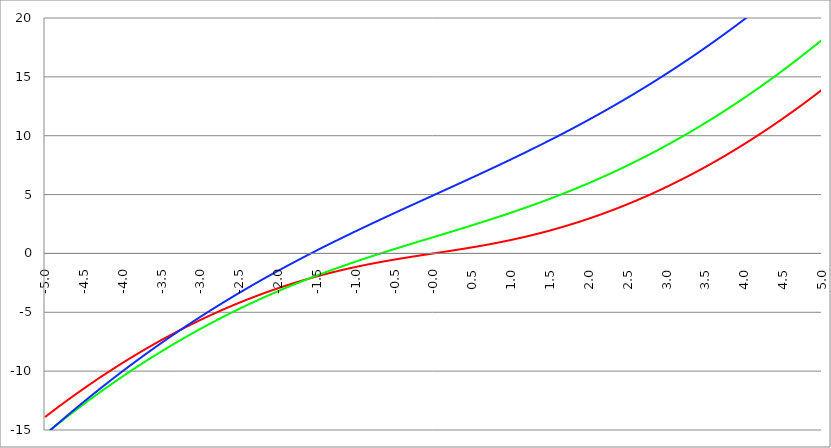
| Category | Series 1 | Series 0 | Series 2 |
|---|---|---|---|
| -5.0 | -13.904 | -15.371 | -15.411 |
| -4.995 | -13.878 | -15.344 | -15.382 |
| -4.99 | -13.853 | -15.317 | -15.352 |
| -4.985 | -13.827 | -15.29 | -15.323 |
| -4.98 | -13.802 | -15.264 | -15.294 |
| -4.975 | -13.777 | -15.237 | -15.265 |
| -4.97 | -13.751 | -15.21 | -15.236 |
| -4.965000000000001 | -13.726 | -15.183 | -15.207 |
| -4.960000000000001 | -13.701 | -15.156 | -15.178 |
| -4.955000000000001 | -13.675 | -15.13 | -15.149 |
| -4.950000000000001 | -13.65 | -15.103 | -15.12 |
| -4.945000000000001 | -13.625 | -15.076 | -15.091 |
| -4.940000000000001 | -13.6 | -15.05 | -15.062 |
| -4.935000000000001 | -13.574 | -15.023 | -15.034 |
| -4.930000000000001 | -13.549 | -14.996 | -15.005 |
| -4.925000000000002 | -13.524 | -14.97 | -14.976 |
| -4.920000000000002 | -13.499 | -14.943 | -14.947 |
| -4.915000000000002 | -13.474 | -14.917 | -14.918 |
| -4.910000000000002 | -13.449 | -14.89 | -14.889 |
| -4.905000000000002 | -13.424 | -14.864 | -14.861 |
| -4.900000000000002 | -13.399 | -14.837 | -14.832 |
| -4.895000000000002 | -13.374 | -14.811 | -14.803 |
| -4.890000000000002 | -13.349 | -14.784 | -14.774 |
| -4.885000000000002 | -13.324 | -14.758 | -14.746 |
| -4.880000000000002 | -13.299 | -14.732 | -14.717 |
| -4.875000000000003 | -13.274 | -14.705 | -14.689 |
| -4.870000000000003 | -13.249 | -14.679 | -14.66 |
| -4.865000000000003 | -13.224 | -14.653 | -14.631 |
| -4.860000000000003 | -13.2 | -14.626 | -14.603 |
| -4.855000000000003 | -13.175 | -14.6 | -14.574 |
| -4.850000000000003 | -13.15 | -14.574 | -14.546 |
| -4.845000000000003 | -13.125 | -14.548 | -14.517 |
| -4.840000000000003 | -13.1 | -14.521 | -14.489 |
| -4.835000000000003 | -13.076 | -14.495 | -14.46 |
| -4.830000000000004 | -13.051 | -14.469 | -14.432 |
| -4.825000000000004 | -13.026 | -14.443 | -14.403 |
| -4.820000000000004 | -13.002 | -14.417 | -14.375 |
| -4.815000000000004 | -12.977 | -14.391 | -14.347 |
| -4.810000000000004 | -12.953 | -14.365 | -14.318 |
| -4.805000000000004 | -12.928 | -14.339 | -14.29 |
| -4.800000000000004 | -12.904 | -14.313 | -14.262 |
| -4.795000000000004 | -12.879 | -14.287 | -14.233 |
| -4.790000000000004 | -12.855 | -14.261 | -14.205 |
| -4.785000000000004 | -12.83 | -14.235 | -14.177 |
| -4.780000000000004 | -12.806 | -14.209 | -14.149 |
| -4.775000000000004 | -12.781 | -14.183 | -14.12 |
| -4.770000000000004 | -12.757 | -14.157 | -14.092 |
| -4.765000000000005 | -12.733 | -14.131 | -14.064 |
| -4.760000000000005 | -12.708 | -14.105 | -14.036 |
| -4.755000000000005 | -12.684 | -14.08 | -14.008 |
| -4.750000000000005 | -12.66 | -14.054 | -13.98 |
| -4.745000000000005 | -12.635 | -14.028 | -13.952 |
| -4.740000000000005 | -12.611 | -14.002 | -13.924 |
| -4.735000000000005 | -12.587 | -13.977 | -13.895 |
| -4.730000000000005 | -12.563 | -13.951 | -13.867 |
| -4.725000000000006 | -12.539 | -13.925 | -13.839 |
| -4.720000000000006 | -12.514 | -13.9 | -13.811 |
| -4.715000000000006 | -12.49 | -13.874 | -13.784 |
| -4.710000000000006 | -12.466 | -13.848 | -13.756 |
| -4.705000000000006 | -12.442 | -13.823 | -13.728 |
| -4.700000000000006 | -12.418 | -13.797 | -13.7 |
| -4.695000000000006 | -12.394 | -13.772 | -13.672 |
| -4.690000000000006 | -12.37 | -13.746 | -13.644 |
| -4.685000000000007 | -12.346 | -13.721 | -13.616 |
| -4.680000000000007 | -12.322 | -13.695 | -13.588 |
| -4.675000000000007 | -12.298 | -13.67 | -13.561 |
| -4.670000000000007 | -12.274 | -13.644 | -13.533 |
| -4.665000000000007 | -12.251 | -13.619 | -13.505 |
| -4.660000000000007 | -12.227 | -13.594 | -13.477 |
| -4.655000000000007 | -12.203 | -13.568 | -13.45 |
| -4.650000000000007 | -12.179 | -13.543 | -13.422 |
| -4.645000000000007 | -12.155 | -13.518 | -13.394 |
| -4.640000000000008 | -12.132 | -13.492 | -13.367 |
| -4.635000000000008 | -12.108 | -13.467 | -13.339 |
| -4.630000000000008 | -12.084 | -13.442 | -13.312 |
| -4.625000000000008 | -12.061 | -13.417 | -13.284 |
| -4.620000000000008 | -12.037 | -13.392 | -13.256 |
| -4.615000000000008 | -12.013 | -13.366 | -13.229 |
| -4.610000000000008 | -11.99 | -13.341 | -13.201 |
| -4.605000000000008 | -11.966 | -13.316 | -13.174 |
| -4.600000000000008 | -11.943 | -13.291 | -13.146 |
| -4.595000000000009 | -11.919 | -13.266 | -13.119 |
| -4.590000000000009 | -11.895 | -13.241 | -13.092 |
| -4.585000000000009 | -11.872 | -13.216 | -13.064 |
| -4.580000000000009 | -11.849 | -13.191 | -13.037 |
| -4.57500000000001 | -11.825 | -13.166 | -13.009 |
| -4.57000000000001 | -11.802 | -13.141 | -12.982 |
| -4.565000000000009 | -11.778 | -13.116 | -12.955 |
| -4.560000000000009 | -11.755 | -13.091 | -12.927 |
| -4.555000000000009 | -11.732 | -13.066 | -12.9 |
| -4.55000000000001 | -11.708 | -13.041 | -12.873 |
| -4.54500000000001 | -11.685 | -13.017 | -12.846 |
| -4.54000000000001 | -11.662 | -12.992 | -12.818 |
| -4.53500000000001 | -11.639 | -12.967 | -12.791 |
| -4.53000000000001 | -11.615 | -12.942 | -12.764 |
| -4.52500000000001 | -11.592 | -12.917 | -12.737 |
| -4.52000000000001 | -11.569 | -12.893 | -12.71 |
| -4.51500000000001 | -11.546 | -12.868 | -12.683 |
| -4.51000000000001 | -11.523 | -12.843 | -12.656 |
| -4.505000000000011 | -11.5 | -12.819 | -12.628 |
| -4.500000000000011 | -11.477 | -12.794 | -12.601 |
| -4.495000000000011 | -11.454 | -12.769 | -12.574 |
| -4.490000000000011 | -11.431 | -12.745 | -12.547 |
| -4.485000000000011 | -11.408 | -12.72 | -12.52 |
| -4.480000000000011 | -11.385 | -12.696 | -12.493 |
| -4.475000000000011 | -11.362 | -12.671 | -12.466 |
| -4.470000000000011 | -11.339 | -12.647 | -12.44 |
| -4.465000000000011 | -11.316 | -12.622 | -12.413 |
| -4.460000000000011 | -11.293 | -12.598 | -12.386 |
| -4.455000000000012 | -11.27 | -12.573 | -12.359 |
| -4.450000000000012 | -11.247 | -12.549 | -12.332 |
| -4.445000000000012 | -11.225 | -12.525 | -12.305 |
| -4.440000000000012 | -11.202 | -12.5 | -12.278 |
| -4.435000000000012 | -11.179 | -12.476 | -12.252 |
| -4.430000000000012 | -11.156 | -12.452 | -12.225 |
| -4.425000000000012 | -11.134 | -12.427 | -12.198 |
| -4.420000000000012 | -11.111 | -12.403 | -12.171 |
| -4.415000000000012 | -11.088 | -12.379 | -12.145 |
| -4.410000000000013 | -11.066 | -12.354 | -12.118 |
| -4.405000000000013 | -11.043 | -12.33 | -12.091 |
| -4.400000000000013 | -11.021 | -12.306 | -12.065 |
| -4.395000000000013 | -10.998 | -12.282 | -12.038 |
| -4.390000000000013 | -10.975 | -12.258 | -12.012 |
| -4.385000000000013 | -10.953 | -12.234 | -11.985 |
| -4.380000000000013 | -10.931 | -12.21 | -11.958 |
| -4.375000000000013 | -10.908 | -12.186 | -11.932 |
| -4.370000000000013 | -10.886 | -12.162 | -11.905 |
| -4.365000000000013 | -10.863 | -12.138 | -11.879 |
| -4.360000000000014 | -10.841 | -12.114 | -11.852 |
| -4.355000000000014 | -10.819 | -12.09 | -11.826 |
| -4.350000000000014 | -10.796 | -12.066 | -11.799 |
| -4.345000000000014 | -10.774 | -12.042 | -11.773 |
| -4.340000000000014 | -10.752 | -12.018 | -11.747 |
| -4.335000000000014 | -10.729 | -11.994 | -11.72 |
| -4.330000000000014 | -10.707 | -11.97 | -11.694 |
| -4.325000000000014 | -10.685 | -11.946 | -11.668 |
| -4.320000000000014 | -10.663 | -11.922 | -11.641 |
| -4.315000000000015 | -10.641 | -11.899 | -11.615 |
| -4.310000000000015 | -10.618 | -11.875 | -11.589 |
| -4.305000000000015 | -10.596 | -11.851 | -11.563 |
| -4.300000000000015 | -10.574 | -11.827 | -11.536 |
| -4.295000000000015 | -10.552 | -11.804 | -11.51 |
| -4.290000000000015 | -10.53 | -11.78 | -11.484 |
| -4.285000000000015 | -10.508 | -11.756 | -11.458 |
| -4.280000000000015 | -10.486 | -11.733 | -11.432 |
| -4.275000000000015 | -10.464 | -11.709 | -11.405 |
| -4.270000000000015 | -10.442 | -11.685 | -11.379 |
| -4.265000000000016 | -10.42 | -11.662 | -11.353 |
| -4.260000000000016 | -10.398 | -11.638 | -11.327 |
| -4.255000000000016 | -10.377 | -11.615 | -11.301 |
| -4.250000000000016 | -10.355 | -11.591 | -11.275 |
| -4.245000000000016 | -10.333 | -11.568 | -11.249 |
| -4.240000000000016 | -10.311 | -11.544 | -11.223 |
| -4.235000000000016 | -10.289 | -11.521 | -11.197 |
| -4.230000000000016 | -10.268 | -11.498 | -11.171 |
| -4.225000000000017 | -10.246 | -11.474 | -11.145 |
| -4.220000000000017 | -10.224 | -11.451 | -11.119 |
| -4.215000000000017 | -10.202 | -11.428 | -11.094 |
| -4.210000000000017 | -10.181 | -11.404 | -11.068 |
| -4.205000000000017 | -10.159 | -11.381 | -11.042 |
| -4.200000000000017 | -10.138 | -11.358 | -11.016 |
| -4.195000000000017 | -10.116 | -11.334 | -10.99 |
| -4.190000000000017 | -10.094 | -11.311 | -10.965 |
| -4.185000000000017 | -10.073 | -11.288 | -10.939 |
| -4.180000000000017 | -10.051 | -11.265 | -10.913 |
| -4.175000000000018 | -10.03 | -11.242 | -10.887 |
| -4.170000000000018 | -10.009 | -11.218 | -10.862 |
| -4.165000000000018 | -9.987 | -11.195 | -10.836 |
| -4.160000000000018 | -9.966 | -11.172 | -10.81 |
| -4.155000000000018 | -9.944 | -11.149 | -10.785 |
| -4.150000000000018 | -9.923 | -11.126 | -10.759 |
| -4.145000000000018 | -9.902 | -11.103 | -10.733 |
| -4.140000000000018 | -9.88 | -11.08 | -10.708 |
| -4.135000000000018 | -9.859 | -11.057 | -10.682 |
| -4.130000000000019 | -9.838 | -11.034 | -10.657 |
| -4.125000000000019 | -9.817 | -11.011 | -10.631 |
| -4.120000000000019 | -9.795 | -10.988 | -10.606 |
| -4.115000000000019 | -9.774 | -10.965 | -10.58 |
| -4.110000000000019 | -9.753 | -10.943 | -10.555 |
| -4.105000000000019 | -9.732 | -10.92 | -10.529 |
| -4.100000000000019 | -9.711 | -10.897 | -10.504 |
| -4.095000000000019 | -9.69 | -10.874 | -10.479 |
| -4.090000000000019 | -9.669 | -10.851 | -10.453 |
| -4.085000000000019 | -9.648 | -10.829 | -10.428 |
| -4.08000000000002 | -9.627 | -10.806 | -10.403 |
| -4.07500000000002 | -9.606 | -10.783 | -10.377 |
| -4.07000000000002 | -9.585 | -10.76 | -10.352 |
| -4.06500000000002 | -9.564 | -10.738 | -10.327 |
| -4.06000000000002 | -9.543 | -10.715 | -10.301 |
| -4.05500000000002 | -9.522 | -10.693 | -10.276 |
| -4.05000000000002 | -9.501 | -10.67 | -10.251 |
| -4.04500000000002 | -9.48 | -10.647 | -10.226 |
| -4.04000000000002 | -9.459 | -10.625 | -10.201 |
| -4.03500000000002 | -9.438 | -10.602 | -10.175 |
| -4.03000000000002 | -9.418 | -10.58 | -10.15 |
| -4.025000000000021 | -9.397 | -10.557 | -10.125 |
| -4.020000000000021 | -9.376 | -10.535 | -10.1 |
| -4.015000000000021 | -9.356 | -10.512 | -10.075 |
| -4.010000000000021 | -9.335 | -10.49 | -10.05 |
| -4.005000000000021 | -9.314 | -10.468 | -10.025 |
| -4.000000000000021 | -9.294 | -10.445 | -10 |
| -3.995000000000021 | -9.273 | -10.423 | -9.975 |
| -3.990000000000021 | -9.252 | -10.401 | -9.95 |
| -3.985000000000022 | -9.232 | -10.378 | -9.925 |
| -3.980000000000022 | -9.211 | -10.356 | -9.9 |
| -3.975000000000022 | -9.191 | -10.334 | -9.875 |
| -3.970000000000022 | -9.17 | -10.311 | -9.85 |
| -3.965000000000022 | -9.15 | -10.289 | -9.825 |
| -3.960000000000022 | -9.129 | -10.267 | -9.801 |
| -3.955000000000022 | -9.109 | -10.245 | -9.776 |
| -3.950000000000022 | -9.089 | -10.223 | -9.751 |
| -3.945000000000022 | -9.068 | -10.201 | -9.726 |
| -3.940000000000023 | -9.048 | -10.179 | -9.701 |
| -3.935000000000023 | -9.028 | -10.156 | -9.677 |
| -3.930000000000023 | -9.007 | -10.134 | -9.652 |
| -3.925000000000023 | -8.987 | -10.112 | -9.627 |
| -3.920000000000023 | -8.967 | -10.09 | -9.603 |
| -3.915000000000023 | -8.947 | -10.068 | -9.578 |
| -3.910000000000023 | -8.926 | -10.046 | -9.553 |
| -3.905000000000023 | -8.906 | -10.024 | -9.529 |
| -3.900000000000023 | -8.886 | -10.002 | -9.504 |
| -3.895000000000023 | -8.866 | -9.981 | -9.479 |
| -3.890000000000024 | -8.846 | -9.959 | -9.455 |
| -3.885000000000024 | -8.826 | -9.937 | -9.43 |
| -3.880000000000024 | -8.806 | -9.915 | -9.406 |
| -3.875000000000024 | -8.786 | -9.893 | -9.381 |
| -3.870000000000024 | -8.766 | -9.871 | -9.357 |
| -3.865000000000024 | -8.746 | -9.85 | -9.332 |
| -3.860000000000024 | -8.726 | -9.828 | -9.308 |
| -3.855000000000024 | -8.706 | -9.806 | -9.283 |
| -3.850000000000024 | -8.686 | -9.784 | -9.259 |
| -3.845000000000025 | -8.666 | -9.763 | -9.235 |
| -3.840000000000025 | -8.646 | -9.741 | -9.21 |
| -3.835000000000025 | -8.626 | -9.719 | -9.186 |
| -3.830000000000025 | -8.607 | -9.698 | -9.161 |
| -3.825000000000025 | -8.587 | -9.676 | -9.137 |
| -3.820000000000025 | -8.567 | -9.655 | -9.113 |
| -3.815000000000025 | -8.547 | -9.633 | -9.089 |
| -3.810000000000025 | -8.528 | -9.612 | -9.064 |
| -3.805000000000025 | -8.508 | -9.59 | -9.04 |
| -3.800000000000026 | -8.488 | -9.569 | -9.016 |
| -3.795000000000026 | -8.469 | -9.547 | -8.992 |
| -3.790000000000026 | -8.449 | -9.526 | -8.968 |
| -3.785000000000026 | -8.429 | -9.504 | -8.943 |
| -3.780000000000026 | -8.41 | -9.483 | -8.919 |
| -3.775000000000026 | -8.39 | -9.462 | -8.895 |
| -3.770000000000026 | -8.371 | -9.44 | -8.871 |
| -3.765000000000026 | -8.351 | -9.419 | -8.847 |
| -3.760000000000026 | -8.332 | -9.398 | -8.823 |
| -3.755000000000026 | -8.312 | -9.376 | -8.799 |
| -3.750000000000027 | -8.293 | -9.355 | -8.775 |
| -3.745000000000027 | -8.274 | -9.334 | -8.751 |
| -3.740000000000027 | -8.254 | -9.313 | -8.727 |
| -3.735000000000027 | -8.235 | -9.291 | -8.703 |
| -3.730000000000027 | -8.216 | -9.27 | -8.679 |
| -3.725000000000027 | -8.196 | -9.249 | -8.655 |
| -3.720000000000027 | -8.177 | -9.228 | -8.631 |
| -3.715000000000027 | -8.158 | -9.207 | -8.607 |
| -3.710000000000027 | -8.139 | -9.186 | -8.583 |
| -3.705000000000028 | -8.119 | -9.165 | -8.559 |
| -3.700000000000028 | -8.1 | -9.144 | -8.536 |
| -3.695000000000028 | -8.081 | -9.123 | -8.512 |
| -3.690000000000028 | -8.062 | -9.102 | -8.488 |
| -3.685000000000028 | -8.043 | -9.081 | -8.464 |
| -3.680000000000028 | -8.024 | -9.06 | -8.441 |
| -3.675000000000028 | -8.005 | -9.039 | -8.417 |
| -3.670000000000028 | -7.986 | -9.018 | -8.393 |
| -3.665000000000028 | -7.967 | -8.997 | -8.369 |
| -3.660000000000028 | -7.948 | -8.976 | -8.346 |
| -3.655000000000029 | -7.929 | -8.955 | -8.322 |
| -3.650000000000029 | -7.91 | -8.934 | -8.298 |
| -3.645000000000029 | -7.891 | -8.914 | -8.275 |
| -3.640000000000029 | -7.872 | -8.893 | -8.251 |
| -3.635000000000029 | -7.853 | -8.872 | -8.228 |
| -3.630000000000029 | -7.834 | -8.851 | -8.204 |
| -3.625000000000029 | -7.815 | -8.831 | -8.181 |
| -3.620000000000029 | -7.797 | -8.81 | -8.157 |
| -3.615000000000029 | -7.778 | -8.789 | -8.134 |
| -3.61000000000003 | -7.759 | -8.769 | -8.11 |
| -3.60500000000003 | -7.74 | -8.748 | -8.087 |
| -3.60000000000003 | -7.722 | -8.727 | -8.063 |
| -3.59500000000003 | -7.703 | -8.707 | -8.04 |
| -3.59000000000003 | -7.684 | -8.686 | -8.016 |
| -3.58500000000003 | -7.666 | -8.666 | -7.993 |
| -3.58000000000003 | -7.647 | -8.645 | -7.97 |
| -3.57500000000003 | -7.629 | -8.625 | -7.946 |
| -3.57000000000003 | -7.61 | -8.604 | -7.923 |
| -3.565000000000031 | -7.592 | -8.584 | -7.9 |
| -3.560000000000031 | -7.573 | -8.563 | -7.876 |
| -3.555000000000031 | -7.555 | -8.543 | -7.853 |
| -3.550000000000031 | -7.536 | -8.523 | -7.83 |
| -3.545000000000031 | -7.518 | -8.502 | -7.807 |
| -3.540000000000031 | -7.499 | -8.482 | -7.783 |
| -3.535000000000031 | -7.481 | -8.462 | -7.76 |
| -3.530000000000031 | -7.463 | -8.441 | -7.737 |
| -3.525000000000031 | -7.444 | -8.421 | -7.714 |
| -3.520000000000032 | -7.426 | -8.401 | -7.691 |
| -3.515000000000032 | -7.408 | -8.381 | -7.668 |
| -3.510000000000032 | -7.389 | -8.36 | -7.645 |
| -3.505000000000032 | -7.371 | -8.34 | -7.621 |
| -3.500000000000032 | -7.353 | -8.32 | -7.598 |
| -3.495000000000032 | -7.335 | -8.3 | -7.575 |
| -3.490000000000032 | -7.317 | -8.28 | -7.552 |
| -3.485000000000032 | -7.298 | -8.26 | -7.529 |
| -3.480000000000032 | -7.28 | -8.24 | -7.506 |
| -3.475000000000032 | -7.262 | -8.219 | -7.483 |
| -3.470000000000033 | -7.244 | -8.199 | -7.46 |
| -3.465000000000033 | -7.226 | -8.179 | -7.438 |
| -3.460000000000033 | -7.208 | -8.159 | -7.415 |
| -3.455000000000033 | -7.19 | -8.139 | -7.392 |
| -3.450000000000033 | -7.172 | -8.12 | -7.369 |
| -3.445000000000033 | -7.154 | -8.1 | -7.346 |
| -3.440000000000033 | -7.136 | -8.08 | -7.323 |
| -3.435000000000033 | -7.118 | -8.06 | -7.3 |
| -3.430000000000033 | -7.101 | -8.04 | -7.278 |
| -3.425000000000034 | -7.083 | -8.02 | -7.255 |
| -3.420000000000034 | -7.065 | -8 | -7.232 |
| -3.415000000000034 | -7.047 | -7.98 | -7.209 |
| -3.410000000000034 | -7.029 | -7.961 | -7.187 |
| -3.405000000000034 | -7.011 | -7.941 | -7.164 |
| -3.400000000000034 | -6.994 | -7.921 | -7.141 |
| -3.395000000000034 | -6.976 | -7.901 | -7.119 |
| -3.390000000000034 | -6.958 | -7.882 | -7.096 |
| -3.385000000000034 | -6.941 | -7.862 | -7.073 |
| -3.380000000000034 | -6.923 | -7.842 | -7.051 |
| -3.375000000000035 | -6.905 | -7.823 | -7.028 |
| -3.370000000000035 | -6.888 | -7.803 | -7.006 |
| -3.365000000000035 | -6.87 | -7.784 | -6.983 |
| -3.360000000000035 | -6.853 | -7.764 | -6.96 |
| -3.355000000000035 | -6.835 | -7.745 | -6.938 |
| -3.350000000000035 | -6.818 | -7.725 | -6.915 |
| -3.345000000000035 | -6.8 | -7.706 | -6.893 |
| -3.340000000000035 | -6.783 | -7.686 | -6.87 |
| -3.335000000000035 | -6.765 | -7.667 | -6.848 |
| -3.330000000000036 | -6.748 | -7.647 | -6.826 |
| -3.325000000000036 | -6.731 | -7.628 | -6.803 |
| -3.320000000000036 | -6.713 | -7.608 | -6.781 |
| -3.315000000000036 | -6.696 | -7.589 | -6.758 |
| -3.310000000000036 | -6.679 | -7.57 | -6.736 |
| -3.305000000000036 | -6.661 | -7.55 | -6.714 |
| -3.300000000000036 | -6.644 | -7.531 | -6.692 |
| -3.295000000000036 | -6.627 | -7.512 | -6.669 |
| -3.290000000000036 | -6.61 | -7.492 | -6.647 |
| -3.285000000000036 | -6.593 | -7.473 | -6.625 |
| -3.280000000000036 | -6.575 | -7.454 | -6.602 |
| -3.275000000000037 | -6.558 | -7.435 | -6.58 |
| -3.270000000000037 | -6.541 | -7.416 | -6.558 |
| -3.265000000000037 | -6.524 | -7.396 | -6.536 |
| -3.260000000000037 | -6.507 | -7.377 | -6.514 |
| -3.255000000000037 | -6.49 | -7.358 | -6.492 |
| -3.250000000000037 | -6.473 | -7.339 | -6.469 |
| -3.245000000000037 | -6.456 | -7.32 | -6.447 |
| -3.240000000000037 | -6.439 | -7.301 | -6.425 |
| -3.235000000000038 | -6.422 | -7.282 | -6.403 |
| -3.230000000000038 | -6.405 | -7.263 | -6.381 |
| -3.225000000000038 | -6.388 | -7.244 | -6.359 |
| -3.220000000000038 | -6.371 | -7.225 | -6.337 |
| -3.215000000000038 | -6.355 | -7.206 | -6.315 |
| -3.210000000000038 | -6.338 | -7.187 | -6.293 |
| -3.205000000000038 | -6.321 | -7.168 | -6.271 |
| -3.200000000000038 | -6.304 | -7.149 | -6.249 |
| -3.195000000000038 | -6.287 | -7.131 | -6.227 |
| -3.190000000000039 | -6.271 | -7.112 | -6.205 |
| -3.185000000000039 | -6.254 | -7.093 | -6.183 |
| -3.180000000000039 | -6.237 | -7.074 | -6.162 |
| -3.175000000000039 | -6.221 | -7.055 | -6.14 |
| -3.170000000000039 | -6.204 | -7.037 | -6.118 |
| -3.16500000000004 | -6.187 | -7.018 | -6.096 |
| -3.16000000000004 | -6.171 | -6.999 | -6.074 |
| -3.155000000000039 | -6.154 | -6.98 | -6.053 |
| -3.150000000000039 | -6.138 | -6.962 | -6.031 |
| -3.14500000000004 | -6.121 | -6.943 | -6.009 |
| -3.14000000000004 | -6.105 | -6.925 | -5.987 |
| -3.13500000000004 | -6.088 | -6.906 | -5.966 |
| -3.13000000000004 | -6.072 | -6.887 | -5.944 |
| -3.12500000000004 | -6.055 | -6.869 | -5.922 |
| -3.12000000000004 | -6.039 | -6.85 | -5.901 |
| -3.11500000000004 | -6.023 | -6.832 | -5.879 |
| -3.11000000000004 | -6.006 | -6.813 | -5.857 |
| -3.10500000000004 | -5.99 | -6.795 | -5.836 |
| -3.10000000000004 | -5.974 | -6.776 | -5.814 |
| -3.095000000000041 | -5.957 | -6.758 | -5.793 |
| -3.090000000000041 | -5.941 | -6.739 | -5.771 |
| -3.085000000000041 | -5.925 | -6.721 | -5.75 |
| -3.080000000000041 | -5.909 | -6.703 | -5.728 |
| -3.075000000000041 | -5.892 | -6.684 | -5.707 |
| -3.070000000000041 | -5.876 | -6.666 | -5.685 |
| -3.065000000000041 | -5.86 | -6.648 | -5.664 |
| -3.060000000000041 | -5.844 | -6.629 | -5.642 |
| -3.055000000000041 | -5.828 | -6.611 | -5.621 |
| -3.050000000000042 | -5.812 | -6.593 | -5.599 |
| -3.045000000000042 | -5.796 | -6.575 | -5.578 |
| -3.040000000000042 | -5.78 | -6.556 | -5.557 |
| -3.035000000000042 | -5.764 | -6.538 | -5.535 |
| -3.030000000000042 | -5.748 | -6.52 | -5.514 |
| -3.025000000000042 | -5.732 | -6.502 | -5.493 |
| -3.020000000000042 | -5.716 | -6.484 | -5.471 |
| -3.015000000000042 | -5.7 | -6.466 | -5.45 |
| -3.010000000000042 | -5.684 | -6.448 | -5.429 |
| -3.005000000000043 | -5.668 | -6.43 | -5.408 |
| -3.000000000000043 | -5.653 | -6.412 | -5.386 |
| -2.995000000000043 | -5.637 | -6.394 | -5.365 |
| -2.990000000000043 | -5.621 | -6.376 | -5.344 |
| -2.985000000000043 | -5.605 | -6.358 | -5.323 |
| -2.980000000000043 | -5.59 | -6.34 | -5.302 |
| -2.975000000000043 | -5.574 | -6.322 | -5.281 |
| -2.970000000000043 | -5.558 | -6.304 | -5.259 |
| -2.965000000000043 | -5.543 | -6.286 | -5.238 |
| -2.960000000000043 | -5.527 | -6.268 | -5.217 |
| -2.955000000000044 | -5.511 | -6.25 | -5.196 |
| -2.950000000000044 | -5.496 | -6.232 | -5.175 |
| -2.945000000000044 | -5.48 | -6.215 | -5.154 |
| -2.940000000000044 | -5.465 | -6.197 | -5.133 |
| -2.935000000000044 | -5.449 | -6.179 | -5.112 |
| -2.930000000000044 | -5.434 | -6.161 | -5.091 |
| -2.925000000000044 | -5.418 | -6.143 | -5.07 |
| -2.920000000000044 | -5.403 | -6.126 | -5.049 |
| -2.915000000000044 | -5.387 | -6.108 | -5.028 |
| -2.910000000000045 | -5.372 | -6.09 | -5.007 |
| -2.905000000000045 | -5.356 | -6.073 | -4.987 |
| -2.900000000000045 | -5.341 | -6.055 | -4.966 |
| -2.895000000000045 | -5.326 | -6.038 | -4.945 |
| -2.890000000000045 | -5.311 | -6.02 | -4.924 |
| -2.885000000000045 | -5.295 | -6.002 | -4.903 |
| -2.880000000000045 | -5.28 | -5.985 | -4.882 |
| -2.875000000000045 | -5.265 | -5.967 | -4.862 |
| -2.870000000000045 | -5.25 | -5.95 | -4.841 |
| -2.865000000000045 | -5.234 | -5.932 | -4.82 |
| -2.860000000000046 | -5.219 | -5.915 | -4.799 |
| -2.855000000000046 | -5.204 | -5.897 | -4.779 |
| -2.850000000000046 | -5.189 | -5.88 | -4.758 |
| -2.845000000000046 | -5.174 | -5.863 | -4.737 |
| -2.840000000000046 | -5.159 | -5.845 | -4.717 |
| -2.835000000000046 | -5.144 | -5.828 | -4.696 |
| -2.830000000000046 | -5.129 | -5.811 | -4.675 |
| -2.825000000000046 | -5.114 | -5.793 | -4.655 |
| -2.820000000000046 | -5.099 | -5.776 | -4.634 |
| -2.815000000000047 | -5.084 | -5.759 | -4.613 |
| -2.810000000000047 | -5.069 | -5.741 | -4.593 |
| -2.805000000000047 | -5.054 | -5.724 | -4.572 |
| -2.800000000000047 | -5.039 | -5.707 | -4.552 |
| -2.795000000000047 | -5.024 | -5.69 | -4.531 |
| -2.790000000000047 | -5.009 | -5.673 | -4.511 |
| -2.785000000000047 | -4.995 | -5.655 | -4.49 |
| -2.780000000000047 | -4.98 | -5.638 | -4.47 |
| -2.775000000000047 | -4.965 | -5.621 | -4.449 |
| -2.770000000000047 | -4.95 | -5.604 | -4.429 |
| -2.765000000000048 | -4.936 | -5.587 | -4.409 |
| -2.760000000000048 | -4.921 | -5.57 | -4.388 |
| -2.755000000000048 | -4.906 | -5.553 | -4.368 |
| -2.750000000000048 | -4.892 | -5.536 | -4.348 |
| -2.745000000000048 | -4.877 | -5.519 | -4.327 |
| -2.740000000000048 | -4.862 | -5.502 | -4.307 |
| -2.735000000000048 | -4.848 | -5.485 | -4.287 |
| -2.730000000000048 | -4.833 | -5.468 | -4.266 |
| -2.725000000000048 | -4.819 | -5.451 | -4.246 |
| -2.720000000000049 | -4.804 | -5.434 | -4.226 |
| -2.715000000000049 | -4.79 | -5.417 | -4.205 |
| -2.710000000000049 | -4.775 | -5.401 | -4.185 |
| -2.705000000000049 | -4.761 | -5.384 | -4.165 |
| -2.700000000000049 | -4.746 | -5.367 | -4.145 |
| -2.695000000000049 | -4.732 | -5.35 | -4.125 |
| -2.690000000000049 | -4.718 | -5.333 | -4.105 |
| -2.685000000000049 | -4.703 | -5.317 | -4.084 |
| -2.680000000000049 | -4.689 | -5.3 | -4.064 |
| -2.675000000000049 | -4.675 | -5.283 | -4.044 |
| -2.67000000000005 | -4.661 | -5.266 | -4.024 |
| -2.66500000000005 | -4.646 | -5.25 | -4.004 |
| -2.66000000000005 | -4.632 | -5.233 | -3.984 |
| -2.65500000000005 | -4.618 | -5.217 | -3.964 |
| -2.65000000000005 | -4.604 | -5.2 | -3.944 |
| -2.64500000000005 | -4.59 | -5.183 | -3.924 |
| -2.64000000000005 | -4.575 | -5.167 | -3.904 |
| -2.63500000000005 | -4.561 | -5.15 | -3.884 |
| -2.63000000000005 | -4.547 | -5.134 | -3.864 |
| -2.625000000000051 | -4.533 | -5.117 | -3.844 |
| -2.620000000000051 | -4.519 | -5.101 | -3.824 |
| -2.615000000000051 | -4.505 | -5.084 | -3.804 |
| -2.610000000000051 | -4.491 | -5.068 | -3.784 |
| -2.605000000000051 | -4.477 | -5.051 | -3.764 |
| -2.600000000000051 | -4.463 | -5.035 | -3.745 |
| -2.595000000000051 | -4.449 | -5.019 | -3.725 |
| -2.590000000000051 | -4.435 | -5.002 | -3.705 |
| -2.585000000000051 | -4.422 | -4.986 | -3.685 |
| -2.580000000000052 | -4.408 | -4.969 | -3.665 |
| -2.575000000000052 | -4.394 | -4.953 | -3.646 |
| -2.570000000000052 | -4.38 | -4.937 | -3.626 |
| -2.565000000000052 | -4.366 | -4.921 | -3.606 |
| -2.560000000000052 | -4.353 | -4.904 | -3.586 |
| -2.555000000000052 | -4.339 | -4.888 | -3.567 |
| -2.550000000000052 | -4.325 | -4.872 | -3.547 |
| -2.545000000000052 | -4.311 | -4.856 | -3.527 |
| -2.540000000000052 | -4.298 | -4.84 | -3.508 |
| -2.535000000000053 | -4.284 | -4.823 | -3.488 |
| -2.530000000000053 | -4.271 | -4.807 | -3.468 |
| -2.525000000000053 | -4.257 | -4.791 | -3.449 |
| -2.520000000000053 | -4.243 | -4.775 | -3.429 |
| -2.515000000000053 | -4.23 | -4.759 | -3.409 |
| -2.510000000000053 | -4.216 | -4.743 | -3.39 |
| -2.505000000000053 | -4.203 | -4.727 | -3.37 |
| -2.500000000000053 | -4.189 | -4.711 | -3.351 |
| -2.495000000000053 | -4.176 | -4.695 | -3.331 |
| -2.490000000000053 | -4.162 | -4.679 | -3.312 |
| -2.485000000000054 | -4.149 | -4.663 | -3.292 |
| -2.480000000000054 | -4.136 | -4.647 | -3.273 |
| -2.475000000000054 | -4.122 | -4.631 | -3.253 |
| -2.470000000000054 | -4.109 | -4.615 | -3.234 |
| -2.465000000000054 | -4.096 | -4.599 | -3.215 |
| -2.460000000000054 | -4.082 | -4.583 | -3.195 |
| -2.455000000000054 | -4.069 | -4.568 | -3.176 |
| -2.450000000000054 | -4.056 | -4.552 | -3.156 |
| -2.445000000000054 | -4.043 | -4.536 | -3.137 |
| -2.440000000000055 | -4.029 | -4.52 | -3.118 |
| -2.435000000000055 | -4.016 | -4.504 | -3.098 |
| -2.430000000000055 | -4.003 | -4.489 | -3.079 |
| -2.425000000000055 | -3.99 | -4.473 | -3.06 |
| -2.420000000000055 | -3.977 | -4.457 | -3.04 |
| -2.415000000000055 | -3.964 | -4.442 | -3.021 |
| -2.410000000000055 | -3.951 | -4.426 | -3.002 |
| -2.405000000000055 | -3.938 | -4.41 | -2.983 |
| -2.400000000000055 | -3.925 | -4.395 | -2.964 |
| -2.395000000000055 | -3.912 | -4.379 | -2.944 |
| -2.390000000000056 | -3.899 | -4.363 | -2.925 |
| -2.385000000000056 | -3.886 | -4.348 | -2.906 |
| -2.380000000000056 | -3.873 | -4.332 | -2.887 |
| -2.375000000000056 | -3.86 | -4.317 | -2.868 |
| -2.370000000000056 | -3.847 | -4.301 | -2.849 |
| -2.365000000000056 | -3.834 | -4.286 | -2.829 |
| -2.360000000000056 | -3.821 | -4.27 | -2.81 |
| -2.355000000000056 | -3.809 | -4.255 | -2.791 |
| -2.350000000000056 | -3.796 | -4.239 | -2.772 |
| -2.345000000000057 | -3.783 | -4.224 | -2.753 |
| -2.340000000000057 | -3.77 | -4.209 | -2.734 |
| -2.335000000000057 | -3.758 | -4.193 | -2.715 |
| -2.330000000000057 | -3.745 | -4.178 | -2.696 |
| -2.325000000000057 | -3.732 | -4.162 | -2.677 |
| -2.320000000000057 | -3.72 | -4.147 | -2.658 |
| -2.315000000000057 | -3.707 | -4.132 | -2.639 |
| -2.310000000000057 | -3.694 | -4.116 | -2.62 |
| -2.305000000000057 | -3.682 | -4.101 | -2.601 |
| -2.300000000000058 | -3.669 | -4.086 | -2.582 |
| -2.295000000000058 | -3.657 | -4.071 | -2.564 |
| -2.290000000000058 | -3.644 | -4.056 | -2.545 |
| -2.285000000000058 | -3.632 | -4.04 | -2.526 |
| -2.280000000000058 | -3.619 | -4.025 | -2.507 |
| -2.275000000000058 | -3.607 | -4.01 | -2.488 |
| -2.270000000000058 | -3.594 | -3.995 | -2.469 |
| -2.265000000000058 | -3.582 | -3.98 | -2.45 |
| -2.260000000000058 | -3.57 | -3.965 | -2.432 |
| -2.255000000000058 | -3.557 | -3.95 | -2.413 |
| -2.250000000000059 | -3.545 | -3.935 | -2.394 |
| -2.245000000000059 | -3.533 | -3.919 | -2.375 |
| -2.240000000000059 | -3.52 | -3.904 | -2.357 |
| -2.235000000000059 | -3.508 | -3.889 | -2.338 |
| -2.23000000000006 | -3.496 | -3.874 | -2.319 |
| -2.22500000000006 | -3.484 | -3.859 | -2.301 |
| -2.22000000000006 | -3.472 | -3.845 | -2.282 |
| -2.215000000000059 | -3.459 | -3.83 | -2.263 |
| -2.210000000000059 | -3.447 | -3.815 | -2.245 |
| -2.20500000000006 | -3.435 | -3.8 | -2.226 |
| -2.20000000000006 | -3.423 | -3.785 | -2.207 |
| -2.19500000000006 | -3.411 | -3.77 | -2.189 |
| -2.19000000000006 | -3.399 | -3.755 | -2.17 |
| -2.18500000000006 | -3.387 | -3.74 | -2.152 |
| -2.18000000000006 | -3.375 | -3.726 | -2.133 |
| -2.17500000000006 | -3.363 | -3.711 | -2.115 |
| -2.17000000000006 | -3.351 | -3.696 | -2.096 |
| -2.16500000000006 | -3.339 | -3.681 | -2.078 |
| -2.160000000000061 | -3.327 | -3.667 | -2.059 |
| -2.155000000000061 | -3.315 | -3.652 | -2.041 |
| -2.150000000000061 | -3.303 | -3.637 | -2.022 |
| -2.145000000000061 | -3.292 | -3.623 | -2.004 |
| -2.140000000000061 | -3.28 | -3.608 | -1.985 |
| -2.135000000000061 | -3.268 | -3.593 | -1.967 |
| -2.130000000000061 | -3.256 | -3.579 | -1.948 |
| -2.125000000000061 | -3.244 | -3.564 | -1.93 |
| -2.120000000000061 | -3.233 | -3.549 | -1.912 |
| -2.115000000000061 | -3.221 | -3.535 | -1.893 |
| -2.110000000000062 | -3.209 | -3.52 | -1.875 |
| -2.105000000000062 | -3.198 | -3.506 | -1.857 |
| -2.100000000000062 | -3.186 | -3.491 | -1.838 |
| -2.095000000000062 | -3.174 | -3.477 | -1.82 |
| -2.090000000000062 | -3.163 | -3.462 | -1.802 |
| -2.085000000000062 | -3.151 | -3.448 | -1.783 |
| -2.080000000000062 | -3.14 | -3.433 | -1.765 |
| -2.075000000000062 | -3.128 | -3.419 | -1.747 |
| -2.070000000000062 | -3.117 | -3.405 | -1.729 |
| -2.065000000000063 | -3.105 | -3.39 | -1.71 |
| -2.060000000000063 | -3.094 | -3.376 | -1.692 |
| -2.055000000000063 | -3.082 | -3.362 | -1.674 |
| -2.050000000000063 | -3.071 | -3.347 | -1.656 |
| -2.045000000000063 | -3.059 | -3.333 | -1.638 |
| -2.040000000000063 | -3.048 | -3.319 | -1.62 |
| -2.035000000000063 | -3.037 | -3.304 | -1.601 |
| -2.030000000000063 | -3.025 | -3.29 | -1.583 |
| -2.025000000000063 | -3.014 | -3.276 | -1.565 |
| -2.020000000000064 | -3.003 | -3.262 | -1.547 |
| -2.015000000000064 | -2.992 | -3.247 | -1.529 |
| -2.010000000000064 | -2.98 | -3.233 | -1.511 |
| -2.005000000000064 | -2.969 | -3.219 | -1.493 |
| -2.000000000000064 | -2.958 | -3.205 | -1.475 |
| -1.995000000000064 | -2.947 | -3.191 | -1.457 |
| -1.990000000000064 | -2.936 | -3.177 | -1.439 |
| -1.985000000000064 | -2.924 | -3.163 | -1.421 |
| -1.980000000000064 | -2.913 | -3.148 | -1.403 |
| -1.975000000000064 | -2.902 | -3.134 | -1.385 |
| -1.970000000000065 | -2.891 | -3.12 | -1.367 |
| -1.965000000000065 | -2.88 | -3.106 | -1.349 |
| -1.960000000000065 | -2.869 | -3.092 | -1.331 |
| -1.955000000000065 | -2.858 | -3.078 | -1.313 |
| -1.950000000000065 | -2.847 | -3.064 | -1.295 |
| -1.945000000000065 | -2.836 | -3.05 | -1.277 |
| -1.940000000000065 | -2.825 | -3.036 | -1.26 |
| -1.935000000000065 | -2.814 | -3.023 | -1.242 |
| -1.930000000000065 | -2.804 | -3.009 | -1.224 |
| -1.925000000000066 | -2.793 | -2.995 | -1.206 |
| -1.920000000000066 | -2.782 | -2.981 | -1.188 |
| -1.915000000000066 | -2.771 | -2.967 | -1.17 |
| -1.910000000000066 | -2.76 | -2.953 | -1.153 |
| -1.905000000000066 | -2.749 | -2.939 | -1.135 |
| -1.900000000000066 | -2.739 | -2.926 | -1.117 |
| -1.895000000000066 | -2.728 | -2.912 | -1.099 |
| -1.890000000000066 | -2.717 | -2.898 | -1.082 |
| -1.885000000000066 | -2.707 | -2.884 | -1.064 |
| -1.880000000000066 | -2.696 | -2.871 | -1.046 |
| -1.875000000000067 | -2.685 | -2.857 | -1.029 |
| -1.870000000000067 | -2.675 | -2.843 | -1.011 |
| -1.865000000000067 | -2.664 | -2.829 | -0.993 |
| -1.860000000000067 | -2.654 | -2.816 | -0.976 |
| -1.855000000000067 | -2.643 | -2.802 | -0.958 |
| -1.850000000000067 | -2.632 | -2.788 | -0.94 |
| -1.845000000000067 | -2.622 | -2.775 | -0.923 |
| -1.840000000000067 | -2.611 | -2.761 | -0.905 |
| -1.835000000000067 | -2.601 | -2.748 | -0.887 |
| -1.830000000000068 | -2.591 | -2.734 | -0.87 |
| -1.825000000000068 | -2.58 | -2.721 | -0.852 |
| -1.820000000000068 | -2.57 | -2.707 | -0.835 |
| -1.815000000000068 | -2.559 | -2.694 | -0.817 |
| -1.810000000000068 | -2.549 | -2.68 | -0.8 |
| -1.805000000000068 | -2.539 | -2.667 | -0.782 |
| -1.800000000000068 | -2.528 | -2.653 | -0.765 |
| -1.795000000000068 | -2.518 | -2.64 | -0.747 |
| -1.790000000000068 | -2.508 | -2.626 | -0.73 |
| -1.785000000000068 | -2.498 | -2.613 | -0.712 |
| -1.780000000000069 | -2.487 | -2.599 | -0.695 |
| -1.775000000000069 | -2.477 | -2.586 | -0.677 |
| -1.770000000000069 | -2.467 | -2.573 | -0.66 |
| -1.765000000000069 | -2.457 | -2.559 | -0.643 |
| -1.760000000000069 | -2.447 | -2.546 | -0.625 |
| -1.75500000000007 | -2.437 | -2.533 | -0.608 |
| -1.75000000000007 | -2.427 | -2.519 | -0.59 |
| -1.745000000000069 | -2.417 | -2.506 | -0.573 |
| -1.740000000000069 | -2.406 | -2.493 | -0.556 |
| -1.73500000000007 | -2.396 | -2.48 | -0.538 |
| -1.73000000000007 | -2.386 | -2.466 | -0.521 |
| -1.72500000000007 | -2.376 | -2.453 | -0.504 |
| -1.72000000000007 | -2.366 | -2.44 | -0.486 |
| -1.71500000000007 | -2.357 | -2.427 | -0.469 |
| -1.71000000000007 | -2.347 | -2.414 | -0.452 |
| -1.70500000000007 | -2.337 | -2.4 | -0.435 |
| -1.70000000000007 | -2.327 | -2.387 | -0.417 |
| -1.69500000000007 | -2.317 | -2.374 | -0.4 |
| -1.69000000000007 | -2.307 | -2.361 | -0.383 |
| -1.685000000000071 | -2.297 | -2.348 | -0.366 |
| -1.680000000000071 | -2.288 | -2.335 | -0.348 |
| -1.675000000000071 | -2.278 | -2.322 | -0.331 |
| -1.670000000000071 | -2.268 | -2.309 | -0.314 |
| -1.665000000000071 | -2.258 | -2.296 | -0.297 |
| -1.660000000000071 | -2.249 | -2.283 | -0.28 |
| -1.655000000000071 | -2.239 | -2.27 | -0.263 |
| -1.650000000000071 | -2.229 | -2.257 | -0.246 |
| -1.645000000000071 | -2.22 | -2.244 | -0.228 |
| -1.640000000000072 | -2.21 | -2.231 | -0.211 |
| -1.635000000000072 | -2.2 | -2.218 | -0.194 |
| -1.630000000000072 | -2.191 | -2.205 | -0.177 |
| -1.625000000000072 | -2.181 | -2.192 | -0.16 |
| -1.620000000000072 | -2.172 | -2.179 | -0.143 |
| -1.615000000000072 | -2.162 | -2.167 | -0.126 |
| -1.610000000000072 | -2.153 | -2.154 | -0.109 |
| -1.605000000000072 | -2.143 | -2.141 | -0.092 |
| -1.600000000000072 | -2.134 | -2.128 | -0.075 |
| -1.595000000000073 | -2.125 | -2.115 | -0.058 |
| -1.590000000000073 | -2.115 | -2.102 | -0.041 |
| -1.585000000000073 | -2.106 | -2.09 | -0.024 |
| -1.580000000000073 | -2.096 | -2.077 | -0.007 |
| -1.575000000000073 | -2.087 | -2.064 | 0.01 |
| -1.570000000000073 | -2.078 | -2.051 | 0.027 |
| -1.565000000000073 | -2.068 | -2.039 | 0.044 |
| -1.560000000000073 | -2.059 | -2.026 | 0.061 |
| -1.555000000000073 | -2.05 | -2.013 | 0.078 |
| -1.550000000000074 | -2.041 | -2.001 | 0.094 |
| -1.545000000000074 | -2.031 | -1.988 | 0.111 |
| -1.540000000000074 | -2.022 | -1.975 | 0.128 |
| -1.535000000000074 | -2.013 | -1.963 | 0.145 |
| -1.530000000000074 | -2.004 | -1.95 | 0.162 |
| -1.525000000000074 | -1.995 | -1.938 | 0.179 |
| -1.520000000000074 | -1.986 | -1.925 | 0.196 |
| -1.515000000000074 | -1.977 | -1.913 | 0.212 |
| -1.510000000000074 | -1.968 | -1.9 | 0.229 |
| -1.505000000000074 | -1.958 | -1.888 | 0.246 |
| -1.500000000000075 | -1.949 | -1.875 | 0.263 |
| -1.495000000000075 | -1.94 | -1.863 | 0.279 |
| -1.490000000000075 | -1.931 | -1.85 | 0.296 |
| -1.485000000000075 | -1.923 | -1.838 | 0.313 |
| -1.480000000000075 | -1.914 | -1.825 | 0.33 |
| -1.475000000000075 | -1.905 | -1.813 | 0.346 |
| -1.470000000000075 | -1.896 | -1.8 | 0.363 |
| -1.465000000000075 | -1.887 | -1.788 | 0.38 |
| -1.460000000000075 | -1.878 | -1.775 | 0.397 |
| -1.455000000000076 | -1.869 | -1.763 | 0.413 |
| -1.450000000000076 | -1.86 | -1.751 | 0.43 |
| -1.445000000000076 | -1.852 | -1.738 | 0.447 |
| -1.440000000000076 | -1.843 | -1.726 | 0.463 |
| -1.435000000000076 | -1.834 | -1.714 | 0.48 |
| -1.430000000000076 | -1.825 | -1.701 | 0.496 |
| -1.425000000000076 | -1.817 | -1.689 | 0.513 |
| -1.420000000000076 | -1.808 | -1.677 | 0.53 |
| -1.415000000000076 | -1.799 | -1.665 | 0.546 |
| -1.410000000000077 | -1.791 | -1.652 | 0.563 |
| -1.405000000000077 | -1.782 | -1.64 | 0.579 |
| -1.400000000000077 | -1.773 | -1.628 | 0.596 |
| -1.395000000000077 | -1.765 | -1.616 | 0.612 |
| -1.390000000000077 | -1.756 | -1.604 | 0.629 |
| -1.385000000000077 | -1.748 | -1.591 | 0.646 |
| -1.380000000000077 | -1.739 | -1.579 | 0.662 |
| -1.375000000000077 | -1.731 | -1.567 | 0.679 |
| -1.370000000000077 | -1.722 | -1.555 | 0.695 |
| -1.365000000000077 | -1.714 | -1.543 | 0.712 |
| -1.360000000000078 | -1.705 | -1.531 | 0.728 |
| -1.355000000000078 | -1.697 | -1.519 | 0.744 |
| -1.350000000000078 | -1.688 | -1.507 | 0.761 |
| -1.345000000000078 | -1.68 | -1.495 | 0.777 |
| -1.340000000000078 | -1.672 | -1.483 | 0.794 |
| -1.335000000000078 | -1.663 | -1.47 | 0.81 |
| -1.330000000000078 | -1.655 | -1.458 | 0.827 |
| -1.325000000000078 | -1.647 | -1.446 | 0.843 |
| -1.320000000000078 | -1.638 | -1.434 | 0.859 |
| -1.315000000000079 | -1.63 | -1.422 | 0.876 |
| -1.310000000000079 | -1.622 | -1.411 | 0.892 |
| -1.305000000000079 | -1.614 | -1.399 | 0.909 |
| -1.300000000000079 | -1.605 | -1.387 | 0.925 |
| -1.295000000000079 | -1.597 | -1.375 | 0.941 |
| -1.29000000000008 | -1.589 | -1.363 | 0.958 |
| -1.285000000000079 | -1.581 | -1.351 | 0.974 |
| -1.280000000000079 | -1.573 | -1.339 | 0.99 |
| -1.275000000000079 | -1.565 | -1.327 | 1.007 |
| -1.270000000000079 | -1.556 | -1.315 | 1.023 |
| -1.26500000000008 | -1.548 | -1.303 | 1.039 |
| -1.26000000000008 | -1.54 | -1.292 | 1.055 |
| -1.25500000000008 | -1.532 | -1.28 | 1.072 |
| -1.25000000000008 | -1.524 | -1.268 | 1.088 |
| -1.24500000000008 | -1.516 | -1.256 | 1.104 |
| -1.24000000000008 | -1.508 | -1.244 | 1.12 |
| -1.23500000000008 | -1.5 | -1.233 | 1.137 |
| -1.23000000000008 | -1.492 | -1.221 | 1.153 |
| -1.22500000000008 | -1.485 | -1.209 | 1.169 |
| -1.220000000000081 | -1.477 | -1.198 | 1.185 |
| -1.215000000000081 | -1.469 | -1.186 | 1.201 |
| -1.210000000000081 | -1.461 | -1.174 | 1.218 |
| -1.205000000000081 | -1.453 | -1.162 | 1.234 |
| -1.200000000000081 | -1.445 | -1.151 | 1.25 |
| -1.195000000000081 | -1.437 | -1.139 | 1.266 |
| -1.190000000000081 | -1.43 | -1.127 | 1.282 |
| -1.185000000000081 | -1.422 | -1.116 | 1.298 |
| -1.180000000000081 | -1.414 | -1.104 | 1.314 |
| -1.175000000000082 | -1.406 | -1.093 | 1.331 |
| -1.170000000000082 | -1.399 | -1.081 | 1.347 |
| -1.165000000000082 | -1.391 | -1.069 | 1.363 |
| -1.160000000000082 | -1.383 | -1.058 | 1.379 |
| -1.155000000000082 | -1.376 | -1.046 | 1.395 |
| -1.150000000000082 | -1.368 | -1.035 | 1.411 |
| -1.145000000000082 | -1.36 | -1.023 | 1.427 |
| -1.140000000000082 | -1.353 | -1.012 | 1.443 |
| -1.135000000000082 | -1.345 | -1 | 1.459 |
| -1.130000000000082 | -1.338 | -0.989 | 1.475 |
| -1.125000000000083 | -1.33 | -0.977 | 1.491 |
| -1.120000000000083 | -1.323 | -0.966 | 1.507 |
| -1.115000000000083 | -1.315 | -0.954 | 1.523 |
| -1.110000000000083 | -1.308 | -0.943 | 1.539 |
| -1.105000000000083 | -1.3 | -0.931 | 1.555 |
| -1.100000000000083 | -1.293 | -0.92 | 1.571 |
| -1.095000000000083 | -1.285 | -0.909 | 1.587 |
| -1.090000000000083 | -1.278 | -0.897 | 1.603 |
| -1.085000000000083 | -1.271 | -0.886 | 1.619 |
| -1.080000000000084 | -1.263 | -0.875 | 1.635 |
| -1.075000000000084 | -1.256 | -0.863 | 1.651 |
| -1.070000000000084 | -1.249 | -0.852 | 1.667 |
| -1.065000000000084 | -1.241 | -0.84 | 1.683 |
| -1.060000000000084 | -1.234 | -0.829 | 1.699 |
| -1.055000000000084 | -1.227 | -0.818 | 1.715 |
| -1.050000000000084 | -1.219 | -0.807 | 1.731 |
| -1.045000000000084 | -1.212 | -0.795 | 1.746 |
| -1.040000000000084 | -1.205 | -0.784 | 1.762 |
| -1.035000000000085 | -1.198 | -0.773 | 1.778 |
| -1.030000000000085 | -1.191 | -0.761 | 1.794 |
| -1.025000000000085 | -1.183 | -0.75 | 1.81 |
| -1.020000000000085 | -1.176 | -0.739 | 1.826 |
| -1.015000000000085 | -1.169 | -0.728 | 1.842 |
| -1.010000000000085 | -1.162 | -0.717 | 1.857 |
| -1.005000000000085 | -1.155 | -0.705 | 1.873 |
| -1.000000000000085 | -1.148 | -0.694 | 1.889 |
| -0.995000000000085 | -1.141 | -0.683 | 1.905 |
| -0.990000000000085 | -1.134 | -0.672 | 1.921 |
| -0.985000000000085 | -1.127 | -0.661 | 1.936 |
| -0.980000000000085 | -1.12 | -0.65 | 1.952 |
| -0.975000000000085 | -1.113 | -0.638 | 1.968 |
| -0.970000000000085 | -1.106 | -0.627 | 1.984 |
| -0.965000000000085 | -1.099 | -0.616 | 2 |
| -0.960000000000085 | -1.092 | -0.605 | 2.015 |
| -0.955000000000085 | -1.085 | -0.594 | 2.031 |
| -0.950000000000085 | -1.078 | -0.583 | 2.047 |
| -0.945000000000085 | -1.071 | -0.572 | 2.063 |
| -0.940000000000085 | -1.064 | -0.561 | 2.078 |
| -0.935000000000085 | -1.057 | -0.55 | 2.094 |
| -0.930000000000085 | -1.051 | -0.539 | 2.11 |
| -0.925000000000085 | -1.044 | -0.528 | 2.125 |
| -0.920000000000085 | -1.037 | -0.517 | 2.141 |
| -0.915000000000085 | -1.03 | -0.506 | 2.157 |
| -0.910000000000085 | -1.023 | -0.495 | 2.172 |
| -0.905000000000085 | -1.017 | -0.484 | 2.188 |
| -0.900000000000085 | -1.01 | -0.473 | 2.204 |
| -0.895000000000085 | -1.003 | -0.462 | 2.219 |
| -0.890000000000085 | -0.996 | -0.451 | 2.235 |
| -0.885000000000085 | -0.99 | -0.44 | 2.251 |
| -0.880000000000085 | -0.983 | -0.429 | 2.266 |
| -0.875000000000085 | -0.976 | -0.418 | 2.282 |
| -0.870000000000085 | -0.97 | -0.407 | 2.298 |
| -0.865000000000085 | -0.963 | -0.396 | 2.313 |
| -0.860000000000085 | -0.957 | -0.385 | 2.329 |
| -0.855000000000085 | -0.95 | -0.374 | 2.344 |
| -0.850000000000085 | -0.943 | -0.364 | 2.36 |
| -0.845000000000085 | -0.937 | -0.353 | 2.376 |
| -0.840000000000085 | -0.93 | -0.342 | 2.391 |
| -0.835000000000085 | -0.924 | -0.331 | 2.407 |
| -0.830000000000085 | -0.917 | -0.32 | 2.422 |
| -0.825000000000085 | -0.911 | -0.309 | 2.438 |
| -0.820000000000085 | -0.904 | -0.299 | 2.453 |
| -0.815000000000085 | -0.898 | -0.288 | 2.469 |
| -0.810000000000085 | -0.891 | -0.277 | 2.485 |
| -0.805000000000085 | -0.885 | -0.266 | 2.5 |
| -0.800000000000085 | -0.879 | -0.255 | 2.516 |
| -0.795000000000085 | -0.872 | -0.245 | 2.531 |
| -0.790000000000085 | -0.866 | -0.234 | 2.547 |
| -0.785000000000085 | -0.859 | -0.223 | 2.562 |
| -0.780000000000085 | -0.853 | -0.212 | 2.578 |
| -0.775000000000085 | -0.847 | -0.202 | 2.593 |
| -0.770000000000085 | -0.84 | -0.191 | 2.609 |
| -0.765000000000085 | -0.834 | -0.18 | 2.624 |
| -0.760000000000085 | -0.828 | -0.17 | 2.64 |
| -0.755000000000085 | -0.822 | -0.159 | 2.655 |
| -0.750000000000085 | -0.815 | -0.148 | 2.671 |
| -0.745000000000085 | -0.809 | -0.137 | 2.686 |
| -0.740000000000085 | -0.803 | -0.127 | 2.701 |
| -0.735000000000085 | -0.797 | -0.116 | 2.717 |
| -0.730000000000085 | -0.79 | -0.106 | 2.732 |
| -0.725000000000085 | -0.784 | -0.095 | 2.748 |
| -0.720000000000085 | -0.778 | -0.084 | 2.763 |
| -0.715000000000085 | -0.772 | -0.074 | 2.779 |
| -0.710000000000085 | -0.766 | -0.063 | 2.794 |
| -0.705000000000085 | -0.76 | -0.052 | 2.809 |
| -0.700000000000085 | -0.754 | -0.042 | 2.825 |
| -0.695000000000085 | -0.747 | -0.031 | 2.84 |
| -0.690000000000085 | -0.741 | -0.021 | 2.856 |
| -0.685000000000085 | -0.735 | -0.01 | 2.871 |
| -0.680000000000085 | -0.729 | 0.001 | 2.886 |
| -0.675000000000085 | -0.723 | 0.011 | 2.902 |
| -0.670000000000085 | -0.717 | 0.022 | 2.917 |
| -0.665000000000085 | -0.711 | 0.032 | 2.933 |
| -0.660000000000085 | -0.705 | 0.043 | 2.948 |
| -0.655000000000085 | -0.699 | 0.053 | 2.963 |
| -0.650000000000085 | -0.693 | 0.064 | 2.979 |
| -0.645000000000085 | -0.687 | 0.074 | 2.994 |
| -0.640000000000085 | -0.681 | 0.085 | 3.009 |
| -0.635000000000085 | -0.675 | 0.095 | 3.025 |
| -0.630000000000085 | -0.669 | 0.106 | 3.04 |
| -0.625000000000085 | -0.664 | 0.116 | 3.055 |
| -0.620000000000085 | -0.658 | 0.127 | 3.071 |
| -0.615000000000085 | -0.652 | 0.137 | 3.086 |
| -0.610000000000085 | -0.646 | 0.148 | 3.101 |
| -0.605000000000085 | -0.64 | 0.158 | 3.117 |
| -0.600000000000085 | -0.634 | 0.169 | 3.132 |
| -0.595000000000085 | -0.628 | 0.179 | 3.147 |
| -0.590000000000085 | -0.623 | 0.189 | 3.162 |
| -0.585000000000085 | -0.617 | 0.2 | 3.178 |
| -0.580000000000085 | -0.611 | 0.21 | 3.193 |
| -0.575000000000085 | -0.605 | 0.221 | 3.208 |
| -0.570000000000085 | -0.6 | 0.231 | 3.224 |
| -0.565000000000085 | -0.594 | 0.241 | 3.239 |
| -0.560000000000085 | -0.588 | 0.252 | 3.254 |
| -0.555000000000085 | -0.582 | 0.262 | 3.269 |
| -0.550000000000085 | -0.577 | 0.273 | 3.285 |
| -0.545000000000085 | -0.571 | 0.283 | 3.3 |
| -0.540000000000085 | -0.565 | 0.293 | 3.315 |
| -0.535000000000085 | -0.56 | 0.304 | 3.33 |
| -0.530000000000085 | -0.554 | 0.314 | 3.346 |
| -0.525000000000085 | -0.548 | 0.324 | 3.361 |
| -0.520000000000085 | -0.543 | 0.335 | 3.376 |
| -0.515000000000085 | -0.537 | 0.345 | 3.391 |
| -0.510000000000085 | -0.531 | 0.355 | 3.406 |
| -0.505000000000085 | -0.526 | 0.366 | 3.422 |
| -0.500000000000085 | -0.52 | 0.376 | 3.437 |
| -0.495000000000085 | -0.515 | 0.386 | 3.452 |
| -0.490000000000085 | -0.509 | 0.397 | 3.467 |
| -0.485000000000085 | -0.503 | 0.407 | 3.482 |
| -0.480000000000085 | -0.498 | 0.417 | 3.498 |
| -0.475000000000085 | -0.492 | 0.427 | 3.513 |
| -0.470000000000085 | -0.487 | 0.438 | 3.528 |
| -0.465000000000085 | -0.481 | 0.448 | 3.543 |
| -0.460000000000085 | -0.476 | 0.458 | 3.558 |
| -0.455000000000085 | -0.47 | 0.469 | 3.574 |
| -0.450000000000085 | -0.465 | 0.479 | 3.589 |
| -0.445000000000085 | -0.459 | 0.489 | 3.604 |
| -0.440000000000085 | -0.454 | 0.499 | 3.619 |
| -0.435000000000085 | -0.448 | 0.509 | 3.634 |
| -0.430000000000085 | -0.443 | 0.52 | 3.649 |
| -0.425000000000085 | -0.437 | 0.53 | 3.665 |
| -0.420000000000085 | -0.432 | 0.54 | 3.68 |
| -0.415000000000085 | -0.427 | 0.55 | 3.695 |
| -0.410000000000085 | -0.421 | 0.561 | 3.71 |
| -0.405000000000085 | -0.416 | 0.571 | 3.725 |
| -0.400000000000085 | -0.41 | 0.581 | 3.74 |
| -0.395000000000085 | -0.405 | 0.591 | 3.755 |
| -0.390000000000085 | -0.4 | 0.601 | 3.77 |
| -0.385000000000085 | -0.394 | 0.612 | 3.786 |
| -0.380000000000085 | -0.389 | 0.622 | 3.801 |
| -0.375000000000085 | -0.384 | 0.632 | 3.816 |
| -0.370000000000085 | -0.378 | 0.642 | 3.831 |
| -0.365000000000085 | -0.373 | 0.652 | 3.846 |
| -0.360000000000085 | -0.368 | 0.662 | 3.861 |
| -0.355000000000085 | -0.362 | 0.673 | 3.876 |
| -0.350000000000085 | -0.357 | 0.683 | 3.891 |
| -0.345000000000085 | -0.352 | 0.693 | 3.906 |
| -0.340000000000085 | -0.346 | 0.703 | 3.922 |
| -0.335000000000085 | -0.341 | 0.713 | 3.937 |
| -0.330000000000085 | -0.336 | 0.723 | 3.952 |
| -0.325000000000085 | -0.331 | 0.733 | 3.967 |
| -0.320000000000085 | -0.325 | 0.744 | 3.982 |
| -0.315000000000085 | -0.32 | 0.754 | 3.997 |
| -0.310000000000085 | -0.315 | 0.764 | 4.012 |
| -0.305000000000085 | -0.31 | 0.774 | 4.027 |
| -0.300000000000085 | -0.304 | 0.784 | 4.042 |
| -0.295000000000085 | -0.299 | 0.794 | 4.057 |
| -0.290000000000085 | -0.294 | 0.804 | 4.072 |
| -0.285000000000085 | -0.289 | 0.814 | 4.087 |
| -0.280000000000085 | -0.284 | 0.824 | 4.103 |
| -0.275000000000085 | -0.278 | 0.835 | 4.118 |
| -0.270000000000085 | -0.273 | 0.845 | 4.133 |
| -0.265000000000085 | -0.268 | 0.855 | 4.148 |
| -0.260000000000085 | -0.263 | 0.865 | 4.163 |
| -0.255000000000085 | -0.258 | 0.875 | 4.178 |
| -0.250000000000085 | -0.253 | 0.885 | 4.193 |
| -0.245000000000085 | -0.247 | 0.895 | 4.208 |
| -0.240000000000085 | -0.242 | 0.905 | 4.223 |
| -0.235000000000085 | -0.237 | 0.915 | 4.238 |
| -0.230000000000085 | -0.232 | 0.925 | 4.253 |
| -0.225000000000085 | -0.227 | 0.935 | 4.268 |
| -0.220000000000085 | -0.222 | 0.945 | 4.283 |
| -0.215000000000085 | -0.217 | 0.955 | 4.298 |
| -0.210000000000085 | -0.212 | 0.966 | 4.313 |
| -0.205000000000085 | -0.206 | 0.976 | 4.328 |
| -0.200000000000085 | -0.201 | 0.986 | 4.343 |
| -0.195000000000085 | -0.196 | 0.996 | 4.358 |
| -0.190000000000085 | -0.191 | 1.006 | 4.373 |
| -0.185000000000085 | -0.186 | 1.016 | 4.388 |
| -0.180000000000085 | -0.181 | 1.026 | 4.403 |
| -0.175000000000085 | -0.176 | 1.036 | 4.418 |
| -0.170000000000085 | -0.171 | 1.046 | 4.433 |
| -0.165000000000085 | -0.166 | 1.056 | 4.449 |
| -0.160000000000085 | -0.161 | 1.066 | 4.464 |
| -0.155000000000084 | -0.156 | 1.076 | 4.479 |
| -0.150000000000084 | -0.151 | 1.086 | 4.494 |
| -0.145000000000084 | -0.146 | 1.096 | 4.509 |
| -0.140000000000084 | -0.14 | 1.106 | 4.524 |
| -0.135000000000084 | -0.135 | 1.116 | 4.539 |
| -0.130000000000084 | -0.13 | 1.126 | 4.554 |
| -0.125000000000084 | -0.125 | 1.136 | 4.569 |
| -0.120000000000084 | -0.12 | 1.146 | 4.584 |
| -0.115000000000084 | -0.115 | 1.156 | 4.599 |
| -0.110000000000084 | -0.11 | 1.166 | 4.614 |
| -0.105000000000084 | -0.105 | 1.176 | 4.629 |
| -0.100000000000084 | -0.1 | 1.186 | 4.644 |
| -0.0950000000000844 | -0.095 | 1.196 | 4.659 |
| -0.0900000000000844 | -0.09 | 1.206 | 4.674 |
| -0.0850000000000844 | -0.085 | 1.216 | 4.689 |
| -0.0800000000000844 | -0.08 | 1.226 | 4.704 |
| -0.0750000000000844 | -0.075 | 1.236 | 4.719 |
| -0.0700000000000844 | -0.07 | 1.246 | 4.734 |
| -0.0650000000000844 | -0.065 | 1.256 | 4.749 |
| -0.0600000000000844 | -0.06 | 1.266 | 4.764 |
| -0.0550000000000844 | -0.055 | 1.276 | 4.779 |
| -0.0500000000000844 | -0.05 | 1.286 | 4.794 |
| -0.0450000000000844 | -0.045 | 1.296 | 4.809 |
| -0.0400000000000844 | -0.04 | 1.306 | 4.824 |
| -0.0350000000000844 | -0.035 | 1.316 | 4.839 |
| -0.0300000000000844 | -0.03 | 1.326 | 4.854 |
| -0.0250000000000844 | -0.025 | 1.336 | 4.869 |
| -0.0200000000000844 | -0.02 | 1.346 | 4.884 |
| -0.0150000000000844 | -0.015 | 1.356 | 4.899 |
| -0.0100000000000844 | -0.01 | 1.366 | 4.914 |
| -0.00500000000008444 | -0.005 | 1.376 | 4.929 |
| -8.4444604087075e-14 | 0 | 1.386 | 4.944 |
| 0.00499999999991555 | 0.005 | 1.396 | 4.959 |
| 0.00999999999991555 | 0.01 | 1.406 | 4.974 |
| 0.0149999999999156 | 0.015 | 1.416 | 4.989 |
| 0.0199999999999156 | 0.02 | 1.426 | 5.004 |
| 0.0249999999999156 | 0.025 | 1.436 | 5.019 |
| 0.0299999999999156 | 0.03 | 1.446 | 5.034 |
| 0.0349999999999155 | 0.035 | 1.456 | 5.049 |
| 0.0399999999999155 | 0.04 | 1.466 | 5.064 |
| 0.0449999999999155 | 0.045 | 1.476 | 5.079 |
| 0.0499999999999155 | 0.05 | 1.486 | 5.094 |
| 0.0549999999999155 | 0.055 | 1.496 | 5.109 |
| 0.0599999999999155 | 0.06 | 1.506 | 5.124 |
| 0.0649999999999155 | 0.065 | 1.516 | 5.139 |
| 0.0699999999999155 | 0.07 | 1.526 | 5.154 |
| 0.0749999999999155 | 0.075 | 1.536 | 5.169 |
| 0.0799999999999155 | 0.08 | 1.546 | 5.184 |
| 0.0849999999999155 | 0.085 | 1.556 | 5.199 |
| 0.0899999999999155 | 0.09 | 1.566 | 5.214 |
| 0.0949999999999155 | 0.095 | 1.576 | 5.229 |
| 0.0999999999999155 | 0.1 | 1.586 | 5.244 |
| 0.104999999999916 | 0.105 | 1.596 | 5.259 |
| 0.109999999999916 | 0.11 | 1.606 | 5.274 |
| 0.114999999999916 | 0.115 | 1.616 | 5.289 |
| 0.119999999999916 | 0.12 | 1.626 | 5.304 |
| 0.124999999999916 | 0.125 | 1.636 | 5.319 |
| 0.129999999999916 | 0.13 | 1.646 | 5.334 |
| 0.134999999999916 | 0.135 | 1.656 | 5.349 |
| 0.139999999999916 | 0.14 | 1.667 | 5.364 |
| 0.144999999999916 | 0.146 | 1.677 | 5.379 |
| 0.149999999999916 | 0.151 | 1.687 | 5.394 |
| 0.154999999999916 | 0.156 | 1.697 | 5.409 |
| 0.159999999999916 | 0.161 | 1.707 | 5.424 |
| 0.164999999999916 | 0.166 | 1.717 | 5.439 |
| 0.169999999999916 | 0.171 | 1.727 | 5.454 |
| 0.174999999999916 | 0.176 | 1.737 | 5.469 |
| 0.179999999999916 | 0.181 | 1.747 | 5.484 |
| 0.184999999999916 | 0.186 | 1.757 | 5.499 |
| 0.189999999999916 | 0.191 | 1.767 | 5.514 |
| 0.194999999999916 | 0.196 | 1.777 | 5.529 |
| 0.199999999999916 | 0.201 | 1.787 | 5.544 |
| 0.204999999999916 | 0.206 | 1.797 | 5.559 |
| 0.209999999999916 | 0.212 | 1.807 | 5.574 |
| 0.214999999999916 | 0.217 | 1.817 | 5.589 |
| 0.219999999999916 | 0.222 | 1.827 | 5.604 |
| 0.224999999999916 | 0.227 | 1.837 | 5.619 |
| 0.229999999999916 | 0.232 | 1.847 | 5.634 |
| 0.234999999999916 | 0.237 | 1.857 | 5.649 |
| 0.239999999999916 | 0.242 | 1.867 | 5.665 |
| 0.244999999999916 | 0.247 | 1.878 | 5.68 |
| 0.249999999999916 | 0.253 | 1.888 | 5.695 |
| 0.254999999999916 | 0.258 | 1.898 | 5.71 |
| 0.259999999999916 | 0.263 | 1.908 | 5.725 |
| 0.264999999999916 | 0.268 | 1.918 | 5.74 |
| 0.269999999999916 | 0.273 | 1.928 | 5.755 |
| 0.274999999999916 | 0.278 | 1.938 | 5.77 |
| 0.279999999999916 | 0.284 | 1.948 | 5.785 |
| 0.284999999999916 | 0.289 | 1.958 | 5.8 |
| 0.289999999999916 | 0.294 | 1.968 | 5.815 |
| 0.294999999999916 | 0.299 | 1.978 | 5.83 |
| 0.299999999999916 | 0.304 | 1.989 | 5.845 |
| 0.304999999999916 | 0.31 | 1.999 | 5.86 |
| 0.309999999999916 | 0.315 | 2.009 | 5.875 |
| 0.314999999999916 | 0.32 | 2.019 | 5.89 |
| 0.319999999999916 | 0.325 | 2.029 | 5.906 |
| 0.324999999999916 | 0.331 | 2.039 | 5.921 |
| 0.329999999999916 | 0.336 | 2.049 | 5.936 |
| 0.334999999999916 | 0.341 | 2.059 | 5.951 |
| 0.339999999999916 | 0.346 | 2.07 | 5.966 |
| 0.344999999999916 | 0.352 | 2.08 | 5.981 |
| 0.349999999999916 | 0.357 | 2.09 | 5.996 |
| 0.354999999999916 | 0.362 | 2.1 | 6.011 |
| 0.359999999999916 | 0.368 | 2.11 | 6.026 |
| 0.364999999999916 | 0.373 | 2.12 | 6.041 |
| 0.369999999999916 | 0.378 | 2.13 | 6.057 |
| 0.374999999999916 | 0.384 | 2.141 | 6.072 |
| 0.379999999999916 | 0.389 | 2.151 | 6.087 |
| 0.384999999999916 | 0.394 | 2.161 | 6.102 |
| 0.389999999999916 | 0.4 | 2.171 | 6.117 |
| 0.394999999999916 | 0.405 | 2.181 | 6.132 |
| 0.399999999999916 | 0.41 | 2.192 | 6.147 |
| 0.404999999999916 | 0.416 | 2.202 | 6.162 |
| 0.409999999999916 | 0.421 | 2.212 | 6.178 |
| 0.414999999999916 | 0.427 | 2.222 | 6.193 |
| 0.419999999999916 | 0.432 | 2.232 | 6.208 |
| 0.424999999999916 | 0.437 | 2.243 | 6.223 |
| 0.429999999999916 | 0.443 | 2.253 | 6.238 |
| 0.434999999999916 | 0.448 | 2.263 | 6.253 |
| 0.439999999999916 | 0.454 | 2.273 | 6.268 |
| 0.444999999999916 | 0.459 | 2.284 | 6.284 |
| 0.449999999999916 | 0.465 | 2.294 | 6.299 |
| 0.454999999999916 | 0.47 | 2.304 | 6.314 |
| 0.459999999999916 | 0.476 | 2.314 | 6.329 |
| 0.464999999999916 | 0.481 | 2.325 | 6.344 |
| 0.469999999999916 | 0.487 | 2.335 | 6.36 |
| 0.474999999999916 | 0.492 | 2.345 | 6.375 |
| 0.479999999999916 | 0.498 | 2.355 | 6.39 |
| 0.484999999999916 | 0.503 | 2.366 | 6.405 |
| 0.489999999999916 | 0.509 | 2.376 | 6.42 |
| 0.494999999999916 | 0.515 | 2.386 | 6.435 |
| 0.499999999999916 | 0.52 | 2.397 | 6.451 |
| 0.504999999999916 | 0.526 | 2.407 | 6.466 |
| 0.509999999999916 | 0.531 | 2.417 | 6.481 |
| 0.514999999999916 | 0.537 | 2.428 | 6.496 |
| 0.519999999999916 | 0.543 | 2.438 | 6.512 |
| 0.524999999999916 | 0.548 | 2.448 | 6.527 |
| 0.529999999999916 | 0.554 | 2.459 | 6.542 |
| 0.534999999999916 | 0.56 | 2.469 | 6.557 |
| 0.539999999999916 | 0.565 | 2.479 | 6.572 |
| 0.544999999999916 | 0.571 | 2.49 | 6.588 |
| 0.549999999999916 | 0.577 | 2.5 | 6.603 |
| 0.554999999999916 | 0.582 | 2.51 | 6.618 |
| 0.559999999999916 | 0.588 | 2.521 | 6.633 |
| 0.564999999999916 | 0.594 | 2.531 | 6.649 |
| 0.569999999999916 | 0.6 | 2.542 | 6.664 |
| 0.574999999999916 | 0.605 | 2.552 | 6.679 |
| 0.579999999999916 | 0.611 | 2.562 | 6.695 |
| 0.584999999999916 | 0.617 | 2.573 | 6.71 |
| 0.589999999999916 | 0.623 | 2.583 | 6.725 |
| 0.594999999999916 | 0.628 | 2.594 | 6.74 |
| 0.599999999999916 | 0.634 | 2.604 | 6.756 |
| 0.604999999999916 | 0.64 | 2.615 | 6.771 |
| 0.609999999999916 | 0.646 | 2.625 | 6.786 |
| 0.614999999999916 | 0.652 | 2.635 | 6.802 |
| 0.619999999999916 | 0.658 | 2.646 | 6.817 |
| 0.624999999999916 | 0.664 | 2.656 | 6.832 |
| 0.629999999999916 | 0.669 | 2.667 | 6.848 |
| 0.634999999999916 | 0.675 | 2.677 | 6.863 |
| 0.639999999999916 | 0.681 | 2.688 | 6.878 |
| 0.644999999999916 | 0.687 | 2.698 | 6.894 |
| 0.649999999999916 | 0.693 | 2.709 | 6.909 |
| 0.654999999999916 | 0.699 | 2.719 | 6.924 |
| 0.659999999999916 | 0.705 | 2.73 | 6.94 |
| 0.664999999999916 | 0.711 | 2.74 | 6.955 |
| 0.669999999999916 | 0.717 | 2.751 | 6.97 |
| 0.674999999999916 | 0.723 | 2.762 | 6.986 |
| 0.679999999999916 | 0.729 | 2.772 | 7.001 |
| 0.684999999999916 | 0.735 | 2.783 | 7.016 |
| 0.689999999999916 | 0.741 | 2.793 | 7.032 |
| 0.694999999999916 | 0.747 | 2.804 | 7.047 |
| 0.699999999999916 | 0.754 | 2.814 | 7.063 |
| 0.704999999999916 | 0.76 | 2.825 | 7.078 |
| 0.709999999999916 | 0.766 | 2.836 | 7.093 |
| 0.714999999999916 | 0.772 | 2.846 | 7.109 |
| 0.719999999999916 | 0.778 | 2.857 | 7.124 |
| 0.724999999999916 | 0.784 | 2.867 | 7.14 |
| 0.729999999999916 | 0.79 | 2.878 | 7.155 |
| 0.734999999999916 | 0.797 | 2.889 | 7.171 |
| 0.739999999999916 | 0.803 | 2.899 | 7.186 |
| 0.744999999999916 | 0.809 | 2.91 | 7.202 |
| 0.749999999999916 | 0.815 | 2.921 | 7.217 |
| 0.754999999999916 | 0.822 | 2.931 | 7.232 |
| 0.759999999999916 | 0.828 | 2.942 | 7.248 |
| 0.764999999999916 | 0.834 | 2.953 | 7.263 |
| 0.769999999999916 | 0.84 | 2.964 | 7.279 |
| 0.774999999999916 | 0.847 | 2.974 | 7.294 |
| 0.779999999999916 | 0.853 | 2.985 | 7.31 |
| 0.784999999999916 | 0.859 | 2.996 | 7.325 |
| 0.789999999999916 | 0.866 | 3.006 | 7.341 |
| 0.794999999999916 | 0.872 | 3.017 | 7.356 |
| 0.799999999999916 | 0.879 | 3.028 | 7.372 |
| 0.804999999999916 | 0.885 | 3.039 | 7.387 |
| 0.809999999999916 | 0.891 | 3.05 | 7.403 |
| 0.814999999999916 | 0.898 | 3.06 | 7.419 |
| 0.819999999999916 | 0.904 | 3.071 | 7.434 |
| 0.824999999999916 | 0.911 | 3.082 | 7.45 |
| 0.829999999999916 | 0.917 | 3.093 | 7.465 |
| 0.834999999999916 | 0.924 | 3.104 | 7.481 |
| 0.839999999999916 | 0.93 | 3.114 | 7.496 |
| 0.844999999999916 | 0.937 | 3.125 | 7.512 |
| 0.849999999999916 | 0.943 | 3.136 | 7.527 |
| 0.854999999999916 | 0.95 | 3.147 | 7.543 |
| 0.859999999999916 | 0.957 | 3.158 | 7.559 |
| 0.864999999999916 | 0.963 | 3.169 | 7.574 |
| 0.869999999999916 | 0.97 | 3.18 | 7.59 |
| 0.874999999999916 | 0.976 | 3.191 | 7.606 |
| 0.879999999999916 | 0.983 | 3.202 | 7.621 |
| 0.884999999999916 | 0.99 | 3.212 | 7.637 |
| 0.889999999999916 | 0.996 | 3.223 | 7.652 |
| 0.894999999999916 | 1.003 | 3.234 | 7.668 |
| 0.899999999999916 | 1.01 | 3.245 | 7.684 |
| 0.904999999999916 | 1.017 | 3.256 | 7.699 |
| 0.909999999999916 | 1.023 | 3.267 | 7.715 |
| 0.914999999999916 | 1.03 | 3.278 | 7.731 |
| 0.919999999999916 | 1.037 | 3.289 | 7.746 |
| 0.924999999999916 | 1.044 | 3.3 | 7.762 |
| 0.929999999999916 | 1.051 | 3.311 | 7.778 |
| 0.934999999999916 | 1.057 | 3.322 | 7.794 |
| 0.939999999999916 | 1.064 | 3.333 | 7.809 |
| 0.944999999999916 | 1.071 | 3.344 | 7.825 |
| 0.949999999999916 | 1.078 | 3.356 | 7.841 |
| 0.954999999999916 | 1.085 | 3.367 | 7.856 |
| 0.959999999999916 | 1.092 | 3.378 | 7.872 |
| 0.964999999999916 | 1.099 | 3.389 | 7.888 |
| 0.969999999999916 | 1.106 | 3.4 | 7.904 |
| 0.974999999999916 | 1.113 | 3.411 | 7.919 |
| 0.979999999999916 | 1.12 | 3.422 | 7.935 |
| 0.984999999999916 | 1.127 | 3.433 | 7.951 |
| 0.989999999999916 | 1.134 | 3.444 | 7.967 |
| 0.994999999999916 | 1.141 | 3.456 | 7.983 |
| 0.999999999999916 | 1.148 | 3.467 | 7.998 |
| 1.004999999999916 | 1.155 | 3.478 | 8.014 |
| 1.009999999999916 | 1.162 | 3.489 | 8.03 |
| 1.014999999999916 | 1.169 | 3.5 | 8.046 |
| 1.019999999999916 | 1.176 | 3.512 | 8.062 |
| 1.024999999999916 | 1.183 | 3.523 | 8.078 |
| 1.029999999999916 | 1.191 | 3.534 | 8.093 |
| 1.034999999999916 | 1.198 | 3.545 | 8.109 |
| 1.039999999999915 | 1.205 | 3.557 | 8.125 |
| 1.044999999999915 | 1.212 | 3.568 | 8.141 |
| 1.049999999999915 | 1.219 | 3.579 | 8.157 |
| 1.054999999999915 | 1.227 | 3.59 | 8.173 |
| 1.059999999999915 | 1.234 | 3.602 | 8.189 |
| 1.064999999999915 | 1.241 | 3.613 | 8.205 |
| 1.069999999999915 | 1.249 | 3.624 | 8.221 |
| 1.074999999999915 | 1.256 | 3.636 | 8.236 |
| 1.079999999999915 | 1.263 | 3.647 | 8.252 |
| 1.084999999999914 | 1.271 | 3.658 | 8.268 |
| 1.089999999999914 | 1.278 | 3.67 | 8.284 |
| 1.094999999999914 | 1.285 | 3.681 | 8.3 |
| 1.099999999999914 | 1.293 | 3.693 | 8.316 |
| 1.104999999999914 | 1.3 | 3.704 | 8.332 |
| 1.109999999999914 | 1.308 | 3.716 | 8.348 |
| 1.114999999999914 | 1.315 | 3.727 | 8.364 |
| 1.119999999999914 | 1.323 | 3.738 | 8.38 |
| 1.124999999999914 | 1.33 | 3.75 | 8.396 |
| 1.129999999999914 | 1.338 | 3.761 | 8.412 |
| 1.134999999999913 | 1.345 | 3.773 | 8.428 |
| 1.139999999999913 | 1.353 | 3.784 | 8.444 |
| 1.144999999999913 | 1.36 | 3.796 | 8.46 |
| 1.149999999999913 | 1.368 | 3.807 | 8.476 |
| 1.154999999999913 | 1.376 | 3.819 | 8.493 |
| 1.159999999999913 | 1.383 | 3.83 | 8.509 |
| 1.164999999999913 | 1.391 | 3.842 | 8.525 |
| 1.169999999999913 | 1.399 | 3.854 | 8.541 |
| 1.174999999999913 | 1.406 | 3.865 | 8.557 |
| 1.179999999999912 | 1.414 | 3.877 | 8.573 |
| 1.184999999999912 | 1.422 | 3.888 | 8.589 |
| 1.189999999999912 | 1.43 | 3.9 | 8.605 |
| 1.194999999999912 | 1.437 | 3.912 | 8.621 |
| 1.199999999999912 | 1.445 | 3.923 | 8.638 |
| 1.204999999999912 | 1.453 | 3.935 | 8.654 |
| 1.209999999999912 | 1.461 | 3.947 | 8.67 |
| 1.214999999999912 | 1.469 | 3.958 | 8.686 |
| 1.219999999999912 | 1.477 | 3.97 | 8.702 |
| 1.224999999999911 | 1.485 | 3.982 | 8.718 |
| 1.229999999999911 | 1.492 | 3.994 | 8.735 |
| 1.234999999999911 | 1.5 | 4.005 | 8.751 |
| 1.239999999999911 | 1.508 | 4.017 | 8.767 |
| 1.244999999999911 | 1.516 | 4.029 | 8.783 |
| 1.249999999999911 | 1.524 | 4.041 | 8.8 |
| 1.254999999999911 | 1.532 | 4.052 | 8.816 |
| 1.259999999999911 | 1.54 | 4.064 | 8.832 |
| 1.264999999999911 | 1.548 | 4.076 | 8.848 |
| 1.269999999999911 | 1.556 | 4.088 | 8.865 |
| 1.27499999999991 | 1.565 | 4.1 | 8.881 |
| 1.27999999999991 | 1.573 | 4.112 | 8.897 |
| 1.28499999999991 | 1.581 | 4.124 | 8.914 |
| 1.28999999999991 | 1.589 | 4.135 | 8.93 |
| 1.29499999999991 | 1.597 | 4.147 | 8.946 |
| 1.29999999999991 | 1.605 | 4.159 | 8.963 |
| 1.30499999999991 | 1.614 | 4.171 | 8.979 |
| 1.30999999999991 | 1.622 | 4.183 | 8.995 |
| 1.31499999999991 | 1.63 | 4.195 | 9.012 |
| 1.319999999999909 | 1.638 | 4.207 | 9.028 |
| 1.324999999999909 | 1.647 | 4.219 | 9.044 |
| 1.329999999999909 | 1.655 | 4.231 | 9.061 |
| 1.334999999999909 | 1.663 | 4.243 | 9.077 |
| 1.339999999999909 | 1.672 | 4.255 | 9.094 |
| 1.344999999999909 | 1.68 | 4.267 | 9.11 |
| 1.349999999999909 | 1.688 | 4.279 | 9.127 |
| 1.354999999999909 | 1.697 | 4.291 | 9.143 |
| 1.359999999999909 | 1.705 | 4.303 | 9.159 |
| 1.364999999999908 | 1.714 | 4.315 | 9.176 |
| 1.369999999999908 | 1.722 | 4.328 | 9.192 |
| 1.374999999999908 | 1.731 | 4.34 | 9.209 |
| 1.379999999999908 | 1.739 | 4.352 | 9.225 |
| 1.384999999999908 | 1.748 | 4.364 | 9.242 |
| 1.389999999999908 | 1.756 | 4.376 | 9.258 |
| 1.394999999999908 | 1.765 | 4.388 | 9.275 |
| 1.399999999999908 | 1.773 | 4.401 | 9.292 |
| 1.404999999999908 | 1.782 | 4.413 | 9.308 |
| 1.409999999999908 | 1.791 | 4.425 | 9.325 |
| 1.414999999999907 | 1.799 | 4.437 | 9.341 |
| 1.419999999999907 | 1.808 | 4.449 | 9.358 |
| 1.424999999999907 | 1.817 | 4.462 | 9.374 |
| 1.429999999999907 | 1.825 | 4.474 | 9.391 |
| 1.434999999999907 | 1.834 | 4.486 | 9.408 |
| 1.439999999999907 | 1.843 | 4.499 | 9.424 |
| 1.444999999999907 | 1.852 | 4.511 | 9.441 |
| 1.449999999999907 | 1.86 | 4.523 | 9.458 |
| 1.454999999999907 | 1.869 | 4.536 | 9.474 |
| 1.459999999999906 | 1.878 | 4.548 | 9.491 |
| 1.464999999999906 | 1.887 | 4.56 | 9.508 |
| 1.469999999999906 | 1.896 | 4.573 | 9.524 |
| 1.474999999999906 | 1.905 | 4.585 | 9.541 |
| 1.479999999999906 | 1.914 | 4.598 | 9.558 |
| 1.484999999999906 | 1.923 | 4.61 | 9.575 |
| 1.489999999999906 | 1.931 | 4.623 | 9.591 |
| 1.494999999999906 | 1.94 | 4.635 | 9.608 |
| 1.499999999999906 | 1.949 | 4.648 | 9.625 |
| 1.504999999999906 | 1.958 | 4.66 | 9.642 |
| 1.509999999999905 | 1.968 | 4.673 | 9.658 |
| 1.514999999999905 | 1.977 | 4.685 | 9.675 |
| 1.519999999999905 | 1.986 | 4.698 | 9.692 |
| 1.524999999999905 | 1.995 | 4.71 | 9.709 |
| 1.529999999999905 | 2.004 | 4.723 | 9.726 |
| 1.534999999999905 | 2.013 | 4.735 | 9.742 |
| 1.539999999999905 | 2.022 | 4.748 | 9.759 |
| 1.544999999999905 | 2.031 | 4.761 | 9.776 |
| 1.549999999999905 | 2.041 | 4.773 | 9.793 |
| 1.554999999999904 | 2.05 | 4.786 | 9.81 |
| 1.559999999999904 | 2.059 | 4.799 | 9.827 |
| 1.564999999999904 | 2.068 | 4.811 | 9.844 |
| 1.569999999999904 | 2.078 | 4.824 | 9.861 |
| 1.574999999999904 | 2.087 | 4.837 | 9.878 |
| 1.579999999999904 | 2.096 | 4.85 | 9.895 |
| 1.584999999999904 | 2.106 | 4.862 | 9.912 |
| 1.589999999999904 | 2.115 | 4.875 | 9.928 |
| 1.594999999999904 | 2.125 | 4.888 | 9.945 |
| 1.599999999999903 | 2.134 | 4.901 | 9.962 |
| 1.604999999999903 | 2.143 | 4.913 | 9.979 |
| 1.609999999999903 | 2.153 | 4.926 | 9.996 |
| 1.614999999999903 | 2.162 | 4.939 | 10.014 |
| 1.619999999999903 | 2.172 | 4.952 | 10.031 |
| 1.624999999999903 | 2.181 | 4.965 | 10.048 |
| 1.629999999999903 | 2.191 | 4.978 | 10.065 |
| 1.634999999999903 | 2.2 | 4.991 | 10.082 |
| 1.639999999999903 | 2.21 | 5.004 | 10.099 |
| 1.644999999999902 | 2.22 | 5.017 | 10.116 |
| 1.649999999999902 | 2.229 | 5.029 | 10.133 |
| 1.654999999999902 | 2.239 | 5.042 | 10.15 |
| 1.659999999999902 | 2.249 | 5.055 | 10.167 |
| 1.664999999999902 | 2.258 | 5.068 | 10.184 |
| 1.669999999999902 | 2.268 | 5.081 | 10.202 |
| 1.674999999999902 | 2.278 | 5.094 | 10.219 |
| 1.679999999999902 | 2.288 | 5.108 | 10.236 |
| 1.684999999999902 | 2.297 | 5.121 | 10.253 |
| 1.689999999999901 | 2.307 | 5.134 | 10.27 |
| 1.694999999999901 | 2.317 | 5.147 | 10.288 |
| 1.699999999999901 | 2.327 | 5.16 | 10.305 |
| 1.704999999999901 | 2.337 | 5.173 | 10.322 |
| 1.709999999999901 | 2.347 | 5.186 | 10.339 |
| 1.714999999999901 | 2.357 | 5.199 | 10.357 |
| 1.719999999999901 | 2.366 | 5.213 | 10.374 |
| 1.724999999999901 | 2.376 | 5.226 | 10.391 |
| 1.729999999999901 | 2.386 | 5.239 | 10.409 |
| 1.734999999999901 | 2.396 | 5.252 | 10.426 |
| 1.7399999999999 | 2.406 | 5.265 | 10.443 |
| 1.7449999999999 | 2.417 | 5.279 | 10.461 |
| 1.7499999999999 | 2.427 | 5.292 | 10.478 |
| 1.7549999999999 | 2.437 | 5.305 | 10.495 |
| 1.7599999999999 | 2.447 | 5.319 | 10.513 |
| 1.7649999999999 | 2.457 | 5.332 | 10.53 |
| 1.7699999999999 | 2.467 | 5.345 | 10.547 |
| 1.7749999999999 | 2.477 | 5.359 | 10.565 |
| 1.7799999999999 | 2.487 | 5.372 | 10.582 |
| 1.784999999999899 | 2.498 | 5.385 | 10.6 |
| 1.789999999999899 | 2.508 | 5.399 | 10.617 |
| 1.794999999999899 | 2.518 | 5.412 | 10.635 |
| 1.799999999999899 | 2.528 | 5.426 | 10.652 |
| 1.804999999999899 | 2.539 | 5.439 | 10.67 |
| 1.809999999999899 | 2.549 | 5.453 | 10.687 |
| 1.814999999999899 | 2.559 | 5.466 | 10.705 |
| 1.819999999999899 | 2.57 | 5.48 | 10.722 |
| 1.824999999999899 | 2.58 | 5.493 | 10.74 |
| 1.829999999999899 | 2.591 | 5.507 | 10.757 |
| 1.834999999999898 | 2.601 | 5.52 | 10.775 |
| 1.839999999999898 | 2.611 | 5.534 | 10.793 |
| 1.844999999999898 | 2.622 | 5.547 | 10.81 |
| 1.849999999999898 | 2.632 | 5.561 | 10.828 |
| 1.854999999999898 | 2.643 | 5.575 | 10.845 |
| 1.859999999999898 | 2.654 | 5.588 | 10.863 |
| 1.864999999999898 | 2.664 | 5.602 | 10.881 |
| 1.869999999999898 | 2.675 | 5.616 | 10.898 |
| 1.874999999999898 | 2.685 | 5.629 | 10.916 |
| 1.879999999999897 | 2.696 | 5.643 | 10.934 |
| 1.884999999999897 | 2.707 | 5.657 | 10.951 |
| 1.889999999999897 | 2.717 | 5.671 | 10.969 |
| 1.894999999999897 | 2.728 | 5.684 | 10.987 |
| 1.899999999999897 | 2.739 | 5.698 | 11.005 |
| 1.904999999999897 | 2.749 | 5.712 | 11.022 |
| 1.909999999999897 | 2.76 | 5.726 | 11.04 |
| 1.914999999999897 | 2.771 | 5.74 | 11.058 |
| 1.919999999999897 | 2.782 | 5.753 | 11.076 |
| 1.924999999999897 | 2.793 | 5.767 | 11.094 |
| 1.929999999999896 | 2.804 | 5.781 | 11.111 |
| 1.934999999999896 | 2.814 | 5.795 | 11.129 |
| 1.939999999999896 | 2.825 | 5.809 | 11.147 |
| 1.944999999999896 | 2.836 | 5.823 | 11.165 |
| 1.949999999999896 | 2.847 | 5.837 | 11.183 |
| 1.954999999999896 | 2.858 | 5.851 | 11.201 |
| 1.959999999999896 | 2.869 | 5.865 | 11.219 |
| 1.964999999999896 | 2.88 | 5.879 | 11.237 |
| 1.969999999999896 | 2.891 | 5.893 | 11.255 |
| 1.974999999999895 | 2.902 | 5.907 | 11.272 |
| 1.979999999999895 | 2.913 | 5.921 | 11.29 |
| 1.984999999999895 | 2.924 | 5.935 | 11.308 |
| 1.989999999999895 | 2.936 | 5.949 | 11.326 |
| 1.994999999999895 | 2.947 | 5.963 | 11.344 |
| 1.999999999999895 | 2.958 | 5.977 | 11.362 |
| 2.004999999999895 | 2.969 | 5.992 | 11.38 |
| 2.009999999999895 | 2.98 | 6.006 | 11.399 |
| 2.014999999999895 | 2.992 | 6.02 | 11.417 |
| 2.019999999999895 | 3.003 | 6.034 | 11.435 |
| 2.024999999999895 | 3.014 | 6.048 | 11.453 |
| 2.029999999999895 | 3.025 | 6.063 | 11.471 |
| 2.034999999999894 | 3.037 | 6.077 | 11.489 |
| 2.039999999999894 | 3.048 | 6.091 | 11.507 |
| 2.044999999999894 | 3.059 | 6.105 | 11.525 |
| 2.049999999999894 | 3.071 | 6.12 | 11.543 |
| 2.054999999999894 | 3.082 | 6.134 | 11.562 |
| 2.059999999999894 | 3.094 | 6.148 | 11.58 |
| 2.064999999999894 | 3.105 | 6.163 | 11.598 |
| 2.069999999999894 | 3.117 | 6.177 | 11.616 |
| 2.074999999999894 | 3.128 | 6.192 | 11.634 |
| 2.079999999999893 | 3.14 | 6.206 | 11.653 |
| 2.084999999999893 | 3.151 | 6.22 | 11.671 |
| 2.089999999999893 | 3.163 | 6.235 | 11.689 |
| 2.094999999999893 | 3.174 | 6.249 | 11.708 |
| 2.099999999999893 | 3.186 | 6.264 | 11.726 |
| 2.104999999999893 | 3.198 | 6.278 | 11.744 |
| 2.109999999999893 | 3.209 | 6.293 | 11.762 |
| 2.114999999999893 | 3.221 | 6.307 | 11.781 |
| 2.119999999999893 | 3.233 | 6.322 | 11.799 |
| 2.124999999999893 | 3.244 | 6.337 | 11.818 |
| 2.129999999999892 | 3.256 | 6.351 | 11.836 |
| 2.134999999999892 | 3.268 | 6.366 | 11.854 |
| 2.139999999999892 | 3.28 | 6.38 | 11.873 |
| 2.144999999999892 | 3.292 | 6.395 | 11.891 |
| 2.149999999999892 | 3.303 | 6.41 | 11.91 |
| 2.154999999999892 | 3.315 | 6.424 | 11.928 |
| 2.159999999999892 | 3.327 | 6.439 | 11.947 |
| 2.164999999999892 | 3.339 | 6.454 | 11.965 |
| 2.169999999999892 | 3.351 | 6.469 | 11.984 |
| 2.174999999999891 | 3.363 | 6.483 | 12.002 |
| 2.179999999999891 | 3.375 | 6.498 | 12.021 |
| 2.184999999999891 | 3.387 | 6.513 | 12.039 |
| 2.189999999999891 | 3.399 | 6.528 | 12.058 |
| 2.194999999999891 | 3.411 | 6.543 | 12.076 |
| 2.199999999999891 | 3.423 | 6.558 | 12.095 |
| 2.204999999999891 | 3.435 | 6.572 | 12.114 |
| 2.209999999999891 | 3.447 | 6.587 | 12.132 |
| 2.214999999999891 | 3.459 | 6.602 | 12.151 |
| 2.21999999999989 | 3.472 | 6.617 | 12.169 |
| 2.22499999999989 | 3.484 | 6.632 | 12.188 |
| 2.22999999999989 | 3.496 | 6.647 | 12.207 |
| 2.23499999999989 | 3.508 | 6.662 | 12.225 |
| 2.23999999999989 | 3.52 | 6.677 | 12.244 |
| 2.24499999999989 | 3.533 | 6.692 | 12.263 |
| 2.24999999999989 | 3.545 | 6.707 | 12.282 |
| 2.25499999999989 | 3.557 | 6.722 | 12.3 |
| 2.25999999999989 | 3.57 | 6.737 | 12.319 |
| 2.26499999999989 | 3.582 | 6.752 | 12.338 |
| 2.269999999999889 | 3.594 | 6.767 | 12.357 |
| 2.274999999999889 | 3.607 | 6.783 | 12.376 |
| 2.279999999999889 | 3.619 | 6.798 | 12.394 |
| 2.284999999999889 | 3.632 | 6.813 | 12.413 |
| 2.289999999999889 | 3.644 | 6.828 | 12.432 |
| 2.294999999999889 | 3.657 | 6.843 | 12.451 |
| 2.299999999999889 | 3.669 | 6.859 | 12.47 |
| 2.304999999999889 | 3.682 | 6.874 | 12.489 |
| 2.309999999999889 | 3.694 | 6.889 | 12.508 |
| 2.314999999999888 | 3.707 | 6.904 | 12.527 |
| 2.319999999999888 | 3.72 | 6.92 | 12.546 |
| 2.324999999999888 | 3.732 | 6.935 | 12.565 |
| 2.329999999999888 | 3.745 | 6.95 | 12.584 |
| 2.334999999999888 | 3.758 | 6.966 | 12.603 |
| 2.339999999999888 | 3.77 | 6.981 | 12.622 |
| 2.344999999999888 | 3.783 | 6.996 | 12.641 |
| 2.349999999999888 | 3.796 | 7.012 | 12.66 |
| 2.354999999999888 | 3.809 | 7.027 | 12.679 |
| 2.359999999999887 | 3.821 | 7.043 | 12.698 |
| 2.364999999999887 | 3.834 | 7.058 | 12.717 |
| 2.369999999999887 | 3.847 | 7.074 | 12.736 |
| 2.374999999999887 | 3.86 | 7.089 | 12.755 |
| 2.379999999999887 | 3.873 | 7.105 | 12.774 |
| 2.384999999999887 | 3.886 | 7.12 | 12.793 |
| 2.389999999999887 | 3.899 | 7.136 | 12.813 |
| 2.394999999999887 | 3.912 | 7.152 | 12.832 |
| 2.399999999999887 | 3.925 | 7.167 | 12.851 |
| 2.404999999999887 | 3.938 | 7.183 | 12.87 |
| 2.409999999999886 | 3.951 | 7.198 | 12.889 |
| 2.414999999999886 | 3.964 | 7.214 | 12.909 |
| 2.419999999999886 | 3.977 | 7.23 | 12.928 |
| 2.424999999999886 | 3.99 | 7.246 | 12.947 |
| 2.429999999999886 | 4.003 | 7.261 | 12.967 |
| 2.434999999999886 | 4.016 | 7.277 | 12.986 |
| 2.439999999999886 | 4.029 | 7.293 | 13.005 |
| 2.444999999999886 | 4.043 | 7.309 | 13.025 |
| 2.449999999999886 | 4.056 | 7.324 | 13.044 |
| 2.454999999999885 | 4.069 | 7.34 | 13.063 |
| 2.459999999999885 | 4.082 | 7.356 | 13.083 |
| 2.464999999999885 | 4.096 | 7.372 | 13.102 |
| 2.469999999999885 | 4.109 | 7.388 | 13.121 |
| 2.474999999999885 | 4.122 | 7.404 | 13.141 |
| 2.479999999999885 | 4.136 | 7.42 | 13.16 |
| 2.484999999999885 | 4.149 | 7.435 | 13.18 |
| 2.489999999999885 | 4.162 | 7.451 | 13.199 |
| 2.494999999999885 | 4.176 | 7.467 | 13.219 |
| 2.499999999999884 | 4.189 | 7.483 | 13.238 |
| 2.504999999999884 | 4.203 | 7.499 | 13.258 |
| 2.509999999999884 | 4.216 | 7.515 | 13.277 |
| 2.514999999999884 | 4.23 | 7.532 | 13.297 |
| 2.519999999999884 | 4.243 | 7.548 | 13.317 |
| 2.524999999999884 | 4.257 | 7.564 | 13.336 |
| 2.529999999999884 | 4.271 | 7.58 | 13.356 |
| 2.534999999999884 | 4.284 | 7.596 | 13.375 |
| 2.539999999999884 | 4.298 | 7.612 | 13.395 |
| 2.544999999999884 | 4.311 | 7.628 | 13.415 |
| 2.549999999999883 | 4.325 | 7.644 | 13.434 |
| 2.554999999999883 | 4.339 | 7.661 | 13.454 |
| 2.559999999999883 | 4.353 | 7.677 | 13.474 |
| 2.564999999999883 | 4.366 | 7.693 | 13.494 |
| 2.569999999999883 | 4.38 | 7.709 | 13.513 |
| 2.574999999999883 | 4.394 | 7.726 | 13.533 |
| 2.579999999999883 | 4.408 | 7.742 | 13.553 |
| 2.584999999999883 | 4.422 | 7.758 | 13.573 |
| 2.589999999999883 | 4.435 | 7.775 | 13.592 |
| 2.594999999999882 | 4.449 | 7.791 | 13.612 |
| 2.599999999999882 | 4.463 | 7.808 | 13.632 |
| 2.604999999999882 | 4.477 | 7.824 | 13.652 |
| 2.609999999999882 | 4.491 | 7.84 | 13.672 |
| 2.614999999999882 | 4.505 | 7.857 | 13.692 |
| 2.619999999999882 | 4.519 | 7.873 | 13.712 |
| 2.624999999999882 | 4.533 | 7.89 | 13.732 |
| 2.629999999999882 | 4.547 | 7.906 | 13.751 |
| 2.634999999999882 | 4.561 | 7.923 | 13.771 |
| 2.639999999999881 | 4.575 | 7.939 | 13.791 |
| 2.644999999999881 | 4.59 | 7.956 | 13.811 |
| 2.649999999999881 | 4.604 | 7.973 | 13.831 |
| 2.654999999999881 | 4.618 | 7.989 | 13.851 |
| 2.659999999999881 | 4.632 | 8.006 | 13.871 |
| 2.664999999999881 | 4.646 | 8.022 | 13.892 |
| 2.669999999999881 | 4.661 | 8.039 | 13.912 |
| 2.674999999999881 | 4.675 | 8.056 | 13.932 |
| 2.679999999999881 | 4.689 | 8.072 | 13.952 |
| 2.68499999999988 | 4.703 | 8.089 | 13.972 |
| 2.68999999999988 | 4.718 | 8.106 | 13.992 |
| 2.69499999999988 | 4.732 | 8.123 | 14.012 |
| 2.69999999999988 | 4.746 | 8.14 | 14.032 |
| 2.70499999999988 | 4.761 | 8.156 | 14.053 |
| 2.70999999999988 | 4.775 | 8.173 | 14.073 |
| 2.71499999999988 | 4.79 | 8.19 | 14.093 |
| 2.71999999999988 | 4.804 | 8.207 | 14.113 |
| 2.72499999999988 | 4.819 | 8.224 | 14.133 |
| 2.72999999999988 | 4.833 | 8.241 | 14.154 |
| 2.734999999999879 | 4.848 | 8.258 | 14.174 |
| 2.739999999999879 | 4.862 | 8.275 | 14.194 |
| 2.744999999999879 | 4.877 | 8.292 | 14.215 |
| 2.749999999999879 | 4.892 | 8.309 | 14.235 |
| 2.754999999999879 | 4.906 | 8.326 | 14.255 |
| 2.759999999999879 | 4.921 | 8.343 | 14.276 |
| 2.764999999999879 | 4.936 | 8.36 | 14.296 |
| 2.769999999999879 | 4.95 | 8.377 | 14.317 |
| 2.774999999999879 | 4.965 | 8.394 | 14.337 |
| 2.779999999999878 | 4.98 | 8.411 | 14.357 |
| 2.784999999999878 | 4.995 | 8.428 | 14.378 |
| 2.789999999999878 | 5.009 | 8.445 | 14.398 |
| 2.794999999999878 | 5.024 | 8.462 | 14.419 |
| 2.799999999999878 | 5.039 | 8.48 | 14.439 |
| 2.804999999999878 | 5.054 | 8.497 | 14.46 |
| 2.809999999999878 | 5.069 | 8.514 | 14.48 |
| 2.814999999999878 | 5.084 | 8.531 | 14.501 |
| 2.819999999999878 | 5.099 | 8.549 | 14.522 |
| 2.824999999999878 | 5.114 | 8.566 | 14.542 |
| 2.829999999999877 | 5.129 | 8.583 | 14.563 |
| 2.834999999999877 | 5.144 | 8.6 | 14.583 |
| 2.839999999999877 | 5.159 | 8.618 | 14.604 |
| 2.844999999999877 | 5.174 | 8.635 | 14.625 |
| 2.849999999999877 | 5.189 | 8.653 | 14.645 |
| 2.854999999999877 | 5.204 | 8.67 | 14.666 |
| 2.859999999999877 | 5.219 | 8.687 | 14.687 |
| 2.864999999999877 | 5.234 | 8.705 | 14.708 |
| 2.869999999999877 | 5.25 | 8.722 | 14.728 |
| 2.874999999999876 | 5.265 | 8.74 | 14.749 |
| 2.879999999999876 | 5.28 | 8.757 | 14.77 |
| 2.884999999999876 | 5.295 | 8.775 | 14.791 |
| 2.889999999999876 | 5.311 | 8.793 | 14.811 |
| 2.894999999999876 | 5.326 | 8.81 | 14.832 |
| 2.899999999999876 | 5.341 | 8.828 | 14.853 |
| 2.904999999999876 | 5.356 | 8.845 | 14.874 |
| 2.909999999999876 | 5.372 | 8.863 | 14.895 |
| 2.914999999999876 | 5.387 | 8.881 | 14.916 |
| 2.919999999999876 | 5.403 | 8.898 | 14.937 |
| 2.924999999999875 | 5.418 | 8.916 | 14.958 |
| 2.929999999999875 | 5.434 | 8.934 | 14.979 |
| 2.934999999999875 | 5.449 | 8.952 | 15 |
| 2.939999999999875 | 5.465 | 8.969 | 15.021 |
| 2.944999999999875 | 5.48 | 8.987 | 15.042 |
| 2.949999999999875 | 5.496 | 9.005 | 15.063 |
| 2.954999999999875 | 5.511 | 9.023 | 15.084 |
| 2.959999999999875 | 5.527 | 9.041 | 15.105 |
| 2.964999999999875 | 5.543 | 9.058 | 15.126 |
| 2.969999999999874 | 5.558 | 9.076 | 15.147 |
| 2.974999999999874 | 5.574 | 9.094 | 15.168 |
| 2.979999999999874 | 5.59 | 9.112 | 15.189 |
| 2.984999999999874 | 5.605 | 9.13 | 15.21 |
| 2.989999999999874 | 5.621 | 9.148 | 15.232 |
| 2.994999999999874 | 5.637 | 9.166 | 15.253 |
| 2.999999999999874 | 5.653 | 9.184 | 15.274 |
| 3.004999999999874 | 5.668 | 9.202 | 15.295 |
| 3.009999999999874 | 5.684 | 9.22 | 15.316 |
| 3.014999999999874 | 5.7 | 9.238 | 15.338 |
| 3.019999999999873 | 5.716 | 9.256 | 15.359 |
| 3.024999999999873 | 5.732 | 9.275 | 15.38 |
| 3.029999999999873 | 5.748 | 9.293 | 15.401 |
| 3.034999999999873 | 5.764 | 9.311 | 15.423 |
| 3.039999999999873 | 5.78 | 9.329 | 15.444 |
| 3.044999999999873 | 5.796 | 9.347 | 15.466 |
| 3.049999999999873 | 5.812 | 9.365 | 15.487 |
| 3.054999999999873 | 5.828 | 9.384 | 15.508 |
| 3.059999999999873 | 5.844 | 9.402 | 15.53 |
| 3.064999999999872 | 5.86 | 9.42 | 15.551 |
| 3.069999999999872 | 5.876 | 9.439 | 15.573 |
| 3.074999999999872 | 5.892 | 9.457 | 15.594 |
| 3.079999999999872 | 5.909 | 9.475 | 15.616 |
| 3.084999999999872 | 5.925 | 9.494 | 15.637 |
| 3.089999999999872 | 5.941 | 9.512 | 15.659 |
| 3.094999999999872 | 5.957 | 9.53 | 15.68 |
| 3.099999999999872 | 5.974 | 9.549 | 15.702 |
| 3.104999999999872 | 5.99 | 9.567 | 15.723 |
| 3.109999999999872 | 6.006 | 9.586 | 15.745 |
| 3.114999999999871 | 6.023 | 9.604 | 15.767 |
| 3.119999999999871 | 6.039 | 9.623 | 15.788 |
| 3.124999999999871 | 6.055 | 9.641 | 15.81 |
| 3.129999999999871 | 6.072 | 9.66 | 15.831 |
| 3.134999999999871 | 6.088 | 9.679 | 15.853 |
| 3.139999999999871 | 6.105 | 9.697 | 15.875 |
| 3.144999999999871 | 6.121 | 9.716 | 15.897 |
| 3.149999999999871 | 6.138 | 9.734 | 15.918 |
| 3.154999999999871 | 6.154 | 9.753 | 15.94 |
| 3.15999999999987 | 6.171 | 9.772 | 15.962 |
| 3.16499999999987 | 6.187 | 9.79 | 15.984 |
| 3.16999999999987 | 6.204 | 9.809 | 16.005 |
| 3.17499999999987 | 6.221 | 9.828 | 16.027 |
| 3.17999999999987 | 6.237 | 9.847 | 16.049 |
| 3.18499999999987 | 6.254 | 9.866 | 16.071 |
| 3.18999999999987 | 6.271 | 9.884 | 16.093 |
| 3.19499999999987 | 6.287 | 9.903 | 16.115 |
| 3.19999999999987 | 6.304 | 9.922 | 16.137 |
| 3.204999999999869 | 6.321 | 9.941 | 16.159 |
| 3.209999999999869 | 6.338 | 9.96 | 16.181 |
| 3.214999999999869 | 6.355 | 9.979 | 16.203 |
| 3.219999999999869 | 6.371 | 9.998 | 16.225 |
| 3.224999999999869 | 6.388 | 10.017 | 16.247 |
| 3.229999999999869 | 6.405 | 10.036 | 16.269 |
| 3.234999999999869 | 6.422 | 10.055 | 16.291 |
| 3.239999999999869 | 6.439 | 10.074 | 16.313 |
| 3.244999999999869 | 6.456 | 10.093 | 16.335 |
| 3.249999999999869 | 6.473 | 10.112 | 16.357 |
| 3.254999999999868 | 6.49 | 10.131 | 16.379 |
| 3.259999999999868 | 6.507 | 10.15 | 16.401 |
| 3.264999999999868 | 6.524 | 10.169 | 16.423 |
| 3.269999999999868 | 6.541 | 10.188 | 16.446 |
| 3.274999999999868 | 6.558 | 10.207 | 16.468 |
| 3.279999999999868 | 6.575 | 10.227 | 16.49 |
| 3.284999999999868 | 6.593 | 10.246 | 16.512 |
| 3.289999999999868 | 6.61 | 10.265 | 16.534 |
| 3.294999999999868 | 6.627 | 10.284 | 16.557 |
| 3.299999999999867 | 6.644 | 10.304 | 16.579 |
| 3.304999999999867 | 6.661 | 10.323 | 16.601 |
| 3.309999999999867 | 6.679 | 10.342 | 16.624 |
| 3.314999999999867 | 6.696 | 10.362 | 16.646 |
| 3.319999999999867 | 6.713 | 10.381 | 16.668 |
| 3.324999999999867 | 6.731 | 10.4 | 16.691 |
| 3.329999999999867 | 6.748 | 10.42 | 16.713 |
| 3.334999999999867 | 6.765 | 10.439 | 16.736 |
| 3.339999999999867 | 6.783 | 10.459 | 16.758 |
| 3.344999999999866 | 6.8 | 10.478 | 16.78 |
| 3.349999999999866 | 6.818 | 10.498 | 16.803 |
| 3.354999999999866 | 6.835 | 10.517 | 16.825 |
| 3.359999999999866 | 6.853 | 10.537 | 16.848 |
| 3.364999999999866 | 6.87 | 10.556 | 16.87 |
| 3.369999999999866 | 6.888 | 10.576 | 16.893 |
| 3.374999999999866 | 6.905 | 10.595 | 16.916 |
| 3.379999999999866 | 6.923 | 10.615 | 16.938 |
| 3.384999999999866 | 6.941 | 10.635 | 16.961 |
| 3.389999999999866 | 6.958 | 10.654 | 16.983 |
| 3.394999999999865 | 6.976 | 10.674 | 17.006 |
| 3.399999999999865 | 6.994 | 10.694 | 17.029 |
| 3.404999999999865 | 7.011 | 10.714 | 17.051 |
| 3.409999999999865 | 7.029 | 10.733 | 17.074 |
| 3.414999999999865 | 7.047 | 10.753 | 17.097 |
| 3.419999999999865 | 7.065 | 10.773 | 17.12 |
| 3.424999999999865 | 7.083 | 10.793 | 17.142 |
| 3.429999999999865 | 7.101 | 10.813 | 17.165 |
| 3.434999999999865 | 7.118 | 10.832 | 17.188 |
| 3.439999999999864 | 7.136 | 10.852 | 17.211 |
| 3.444999999999864 | 7.154 | 10.872 | 17.234 |
| 3.449999999999864 | 7.172 | 10.892 | 17.256 |
| 3.454999999999864 | 7.19 | 10.912 | 17.279 |
| 3.459999999999864 | 7.208 | 10.932 | 17.302 |
| 3.464999999999864 | 7.226 | 10.952 | 17.325 |
| 3.469999999999864 | 7.244 | 10.972 | 17.348 |
| 3.474999999999864 | 7.262 | 10.992 | 17.371 |
| 3.479999999999864 | 7.28 | 11.012 | 17.394 |
| 3.484999999999864 | 7.298 | 11.032 | 17.417 |
| 3.489999999999863 | 7.317 | 11.052 | 17.44 |
| 3.494999999999863 | 7.335 | 11.072 | 17.463 |
| 3.499999999999863 | 7.353 | 11.093 | 17.486 |
| 3.504999999999863 | 7.371 | 11.113 | 17.509 |
| 3.509999999999863 | 7.389 | 11.133 | 17.532 |
| 3.514999999999863 | 7.408 | 11.153 | 17.555 |
| 3.519999999999863 | 7.426 | 11.173 | 17.578 |
| 3.524999999999863 | 7.444 | 11.194 | 17.601 |
| 3.529999999999863 | 7.463 | 11.214 | 17.625 |
| 3.534999999999862 | 7.481 | 11.234 | 17.648 |
| 3.539999999999862 | 7.499 | 11.255 | 17.671 |
| 3.544999999999862 | 7.518 | 11.275 | 17.694 |
| 3.549999999999862 | 7.536 | 11.295 | 17.717 |
| 3.554999999999862 | 7.555 | 11.316 | 17.741 |
| 3.559999999999862 | 7.573 | 11.336 | 17.764 |
| 3.564999999999862 | 7.592 | 11.356 | 17.787 |
| 3.569999999999862 | 7.61 | 11.377 | 17.81 |
| 3.574999999999862 | 7.629 | 11.397 | 17.834 |
| 3.579999999999862 | 7.647 | 11.418 | 17.857 |
| 3.584999999999861 | 7.666 | 11.438 | 17.88 |
| 3.589999999999861 | 7.684 | 11.459 | 17.904 |
| 3.594999999999861 | 7.703 | 11.479 | 17.927 |
| 3.599999999999861 | 7.722 | 11.5 | 17.951 |
| 3.604999999999861 | 7.74 | 11.521 | 17.974 |
| 3.609999999999861 | 7.759 | 11.541 | 17.998 |
| 3.614999999999861 | 7.778 | 11.562 | 18.021 |
| 3.619999999999861 | 7.797 | 11.583 | 18.045 |
| 3.62499999999986 | 7.815 | 11.603 | 18.068 |
| 3.62999999999986 | 7.834 | 11.624 | 18.092 |
| 3.63499999999986 | 7.853 | 11.645 | 18.115 |
| 3.63999999999986 | 7.872 | 11.665 | 18.139 |
| 3.64499999999986 | 7.891 | 11.686 | 18.162 |
| 3.64999999999986 | 7.91 | 11.707 | 18.186 |
| 3.65499999999986 | 7.929 | 11.728 | 18.21 |
| 3.65999999999986 | 7.948 | 11.749 | 18.233 |
| 3.66499999999986 | 7.967 | 11.77 | 18.257 |
| 3.669999999999859 | 7.986 | 11.79 | 18.281 |
| 3.674999999999859 | 8.005 | 11.811 | 18.304 |
| 3.679999999999859 | 8.024 | 11.832 | 18.328 |
| 3.684999999999859 | 8.043 | 11.853 | 18.352 |
| 3.689999999999859 | 8.062 | 11.874 | 18.376 |
| 3.694999999999859 | 8.081 | 11.895 | 18.399 |
| 3.699999999999859 | 8.1 | 11.916 | 18.423 |
| 3.704999999999859 | 8.119 | 11.937 | 18.447 |
| 3.709999999999859 | 8.139 | 11.958 | 18.471 |
| 3.714999999999859 | 8.158 | 11.979 | 18.495 |
| 3.719999999999858 | 8.177 | 12.001 | 18.519 |
| 3.724999999999858 | 8.196 | 12.022 | 18.543 |
| 3.729999999999858 | 8.216 | 12.043 | 18.566 |
| 3.734999999999858 | 8.235 | 12.064 | 18.59 |
| 3.739999999999858 | 8.254 | 12.085 | 18.614 |
| 3.744999999999858 | 8.274 | 12.106 | 18.638 |
| 3.749999999999858 | 8.293 | 12.128 | 18.662 |
| 3.754999999999858 | 8.312 | 12.149 | 18.686 |
| 3.759999999999858 | 8.332 | 12.17 | 18.71 |
| 3.764999999999857 | 8.351 | 12.191 | 18.734 |
| 3.769999999999857 | 8.371 | 12.213 | 18.759 |
| 3.774999999999857 | 8.39 | 12.234 | 18.783 |
| 3.779999999999857 | 8.41 | 12.256 | 18.807 |
| 3.784999999999857 | 8.429 | 12.277 | 18.831 |
| 3.789999999999857 | 8.449 | 12.298 | 18.855 |
| 3.794999999999857 | 8.469 | 12.32 | 18.879 |
| 3.799999999999857 | 8.488 | 12.341 | 18.903 |
| 3.804999999999857 | 8.508 | 12.363 | 18.928 |
| 3.809999999999857 | 8.528 | 12.384 | 18.952 |
| 3.814999999999856 | 8.547 | 12.406 | 18.976 |
| 3.819999999999856 | 8.567 | 12.427 | 19 |
| 3.824999999999856 | 8.587 | 12.449 | 19.025 |
| 3.829999999999856 | 8.607 | 12.47 | 19.049 |
| 3.834999999999856 | 8.626 | 12.492 | 19.073 |
| 3.839999999999856 | 8.646 | 12.514 | 19.098 |
| 3.844999999999856 | 8.666 | 12.535 | 19.122 |
| 3.849999999999856 | 8.686 | 12.557 | 19.146 |
| 3.854999999999856 | 8.706 | 12.579 | 19.171 |
| 3.859999999999855 | 8.726 | 12.6 | 19.195 |
| 3.864999999999855 | 8.746 | 12.622 | 19.22 |
| 3.869999999999855 | 8.766 | 12.644 | 19.244 |
| 3.874999999999855 | 8.786 | 12.666 | 19.269 |
| 3.879999999999855 | 8.806 | 12.688 | 19.293 |
| 3.884999999999855 | 8.826 | 12.709 | 19.318 |
| 3.889999999999855 | 8.846 | 12.731 | 19.342 |
| 3.894999999999855 | 8.866 | 12.753 | 19.367 |
| 3.899999999999855 | 8.886 | 12.775 | 19.391 |
| 3.904999999999855 | 8.906 | 12.797 | 19.416 |
| 3.909999999999854 | 8.926 | 12.819 | 19.441 |
| 3.914999999999854 | 8.947 | 12.841 | 19.465 |
| 3.919999999999854 | 8.967 | 12.863 | 19.49 |
| 3.924999999999854 | 8.987 | 12.885 | 19.515 |
| 3.929999999999854 | 9.007 | 12.907 | 19.539 |
| 3.934999999999854 | 9.028 | 12.929 | 19.564 |
| 3.939999999999854 | 9.048 | 12.951 | 19.589 |
| 3.944999999999854 | 9.068 | 12.973 | 19.614 |
| 3.949999999999854 | 9.089 | 12.995 | 19.639 |
| 3.954999999999853 | 9.109 | 13.017 | 19.663 |
| 3.959999999999853 | 9.129 | 13.04 | 19.688 |
| 3.964999999999853 | 9.15 | 13.062 | 19.713 |
| 3.969999999999853 | 9.17 | 13.084 | 19.738 |
| 3.974999999999853 | 9.191 | 13.106 | 19.763 |
| 3.979999999999853 | 9.211 | 13.129 | 19.788 |
| 3.984999999999853 | 9.232 | 13.151 | 19.813 |
| 3.989999999999853 | 9.252 | 13.173 | 19.838 |
| 3.994999999999853 | 9.273 | 13.195 | 19.863 |
| 3.999999999999853 | 9.294 | 13.218 | 19.888 |
| 4.004999999999852 | 9.314 | 13.24 | 19.913 |
| 4.009999999999852 | 9.335 | 13.263 | 19.938 |
| 4.014999999999852 | 9.356 | 13.285 | 19.963 |
| 4.019999999999852 | 9.376 | 13.307 | 19.988 |
| 4.024999999999852 | 9.397 | 13.33 | 20.013 |
| 4.029999999999852 | 9.418 | 13.352 | 20.038 |
| 4.034999999999852 | 9.438 | 13.375 | 20.063 |
| 4.039999999999851 | 9.459 | 13.397 | 20.088 |
| 4.044999999999852 | 9.48 | 13.42 | 20.113 |
| 4.049999999999851 | 9.501 | 13.443 | 20.139 |
| 4.054999999999851 | 9.522 | 13.465 | 20.164 |
| 4.059999999999851 | 9.543 | 13.488 | 20.189 |
| 4.064999999999851 | 9.564 | 13.51 | 20.214 |
| 4.069999999999851 | 9.585 | 13.533 | 20.239 |
| 4.074999999999851 | 9.606 | 13.556 | 20.265 |
| 4.07999999999985 | 9.627 | 13.578 | 20.29 |
| 4.084999999999851 | 9.648 | 13.601 | 20.315 |
| 4.08999999999985 | 9.669 | 13.624 | 20.341 |
| 4.094999999999851 | 9.69 | 13.647 | 20.366 |
| 4.09999999999985 | 9.711 | 13.67 | 20.392 |
| 4.10499999999985 | 9.732 | 13.692 | 20.417 |
| 4.10999999999985 | 9.753 | 13.715 | 20.442 |
| 4.11499999999985 | 9.774 | 13.738 | 20.468 |
| 4.11999999999985 | 9.795 | 13.761 | 20.493 |
| 4.12499999999985 | 9.817 | 13.784 | 20.519 |
| 4.12999999999985 | 9.838 | 13.807 | 20.544 |
| 4.13499999999985 | 9.859 | 13.83 | 20.57 |
| 4.13999999999985 | 9.88 | 13.853 | 20.595 |
| 4.144999999999849 | 9.902 | 13.876 | 20.621 |
| 4.14999999999985 | 9.923 | 13.899 | 20.647 |
| 4.154999999999849 | 9.944 | 13.922 | 20.672 |
| 4.15999999999985 | 9.966 | 13.945 | 20.698 |
| 4.164999999999849 | 9.987 | 13.968 | 20.723 |
| 4.169999999999849 | 10.009 | 13.991 | 20.749 |
| 4.174999999999849 | 10.03 | 14.014 | 20.775 |
| 4.179999999999848 | 10.051 | 14.037 | 20.801 |
| 4.184999999999849 | 10.073 | 14.061 | 20.826 |
| 4.189999999999848 | 10.094 | 14.084 | 20.852 |
| 4.194999999999848 | 10.116 | 14.107 | 20.878 |
| 4.199999999999848 | 10.138 | 14.13 | 20.904 |
| 4.204999999999848 | 10.159 | 14.153 | 20.929 |
| 4.209999999999848 | 10.181 | 14.177 | 20.955 |
| 4.214999999999848 | 10.202 | 14.2 | 20.981 |
| 4.219999999999847 | 10.224 | 14.223 | 21.007 |
| 4.224999999999848 | 10.246 | 14.247 | 21.033 |
| 4.229999999999847 | 10.268 | 14.27 | 21.059 |
| 4.234999999999847 | 10.289 | 14.294 | 21.085 |
| 4.239999999999847 | 10.311 | 14.317 | 21.111 |
| 4.244999999999847 | 10.333 | 14.34 | 21.137 |
| 4.249999999999847 | 10.355 | 14.364 | 21.163 |
| 4.254999999999847 | 10.377 | 14.387 | 21.189 |
| 4.259999999999846 | 10.398 | 14.411 | 21.215 |
| 4.264999999999847 | 10.42 | 14.434 | 21.241 |
| 4.269999999999846 | 10.442 | 14.458 | 21.267 |
| 4.274999999999846 | 10.464 | 14.482 | 21.293 |
| 4.279999999999846 | 10.486 | 14.505 | 21.319 |
| 4.284999999999846 | 10.508 | 14.529 | 21.345 |
| 4.289999999999846 | 10.53 | 14.553 | 21.371 |
| 4.294999999999846 | 10.552 | 14.576 | 21.398 |
| 4.299999999999846 | 10.574 | 14.6 | 21.424 |
| 4.304999999999846 | 10.596 | 14.624 | 21.45 |
| 4.309999999999845 | 10.618 | 14.647 | 21.476 |
| 4.314999999999846 | 10.641 | 14.671 | 21.503 |
| 4.319999999999845 | 10.663 | 14.695 | 21.529 |
| 4.324999999999846 | 10.685 | 14.719 | 21.555 |
| 4.329999999999845 | 10.707 | 14.743 | 21.581 |
| 4.334999999999845 | 10.729 | 14.766 | 21.608 |
| 4.339999999999845 | 10.752 | 14.79 | 21.634 |
| 4.344999999999845 | 10.774 | 14.814 | 21.661 |
| 4.349999999999845 | 10.796 | 14.838 | 21.687 |
| 4.354999999999845 | 10.819 | 14.862 | 21.713 |
| 4.359999999999844 | 10.841 | 14.886 | 21.74 |
| 4.364999999999845 | 10.863 | 14.91 | 21.766 |
| 4.369999999999844 | 10.886 | 14.934 | 21.793 |
| 4.374999999999844 | 10.908 | 14.958 | 21.819 |
| 4.379999999999844 | 10.931 | 14.982 | 21.846 |
| 4.384999999999844 | 10.953 | 15.006 | 21.872 |
| 4.389999999999844 | 10.975 | 15.03 | 21.899 |
| 4.394999999999844 | 10.998 | 15.055 | 21.926 |
| 4.399999999999844 | 11.021 | 15.079 | 21.952 |
| 4.404999999999844 | 11.043 | 15.103 | 21.979 |
| 4.409999999999843 | 11.066 | 15.127 | 22.006 |
| 4.414999999999844 | 11.088 | 15.151 | 22.032 |
| 4.419999999999843 | 11.111 | 15.176 | 22.059 |
| 4.424999999999843 | 11.134 | 15.2 | 22.086 |
| 4.429999999999843 | 11.156 | 15.224 | 22.112 |
| 4.434999999999843 | 11.179 | 15.248 | 22.139 |
| 4.439999999999843 | 11.202 | 15.273 | 22.166 |
| 4.444999999999843 | 11.225 | 15.297 | 22.193 |
| 4.449999999999842 | 11.247 | 15.321 | 22.22 |
| 4.454999999999843 | 11.27 | 15.346 | 22.246 |
| 4.459999999999842 | 11.293 | 15.37 | 22.273 |
| 4.464999999999843 | 11.316 | 15.395 | 22.3 |
| 4.469999999999842 | 11.339 | 15.419 | 22.327 |
| 4.474999999999842 | 11.362 | 15.444 | 22.354 |
| 4.479999999999842 | 11.385 | 15.468 | 22.381 |
| 4.484999999999842 | 11.408 | 15.493 | 22.408 |
| 4.489999999999842 | 11.431 | 15.517 | 22.435 |
| 4.494999999999842 | 11.454 | 15.542 | 22.462 |
| 4.499999999999841 | 11.477 | 15.567 | 22.489 |
| 4.504999999999842 | 11.5 | 15.591 | 22.516 |
| 4.509999999999841 | 11.523 | 15.616 | 22.543 |
| 4.514999999999842 | 11.546 | 15.641 | 22.57 |
| 4.519999999999841 | 11.569 | 15.665 | 22.597 |
| 4.524999999999841 | 11.592 | 15.69 | 22.624 |
| 4.529999999999841 | 11.615 | 15.715 | 22.652 |
| 4.534999999999841 | 11.639 | 15.739 | 22.679 |
| 4.53999999999984 | 11.662 | 15.764 | 22.706 |
| 4.544999999999841 | 11.685 | 15.789 | 22.733 |
| 4.54999999999984 | 11.708 | 15.814 | 22.76 |
| 4.554999999999841 | 11.732 | 15.839 | 22.788 |
| 4.55999999999984 | 11.755 | 15.864 | 22.815 |
| 4.564999999999841 | 11.778 | 15.889 | 22.842 |
| 4.56999999999984 | 11.802 | 15.914 | 22.87 |
| 4.57499999999984 | 11.825 | 15.938 | 22.897 |
| 4.57999999999984 | 11.849 | 15.963 | 22.924 |
| 4.58499999999984 | 11.872 | 15.988 | 22.952 |
| 4.58999999999984 | 11.895 | 16.013 | 22.979 |
| 4.59499999999984 | 11.919 | 16.039 | 23.006 |
| 4.59999999999984 | 11.943 | 16.064 | 23.034 |
| 4.60499999999984 | 11.966 | 16.089 | 23.061 |
| 4.60999999999984 | 11.99 | 16.114 | 23.089 |
| 4.614999999999839 | 12.013 | 16.139 | 23.116 |
| 4.61999999999984 | 12.037 | 16.164 | 23.144 |
| 4.624999999999839 | 12.061 | 16.189 | 23.171 |
| 4.62999999999984 | 12.084 | 16.214 | 23.199 |
| 4.634999999999839 | 12.108 | 16.24 | 23.227 |
| 4.639999999999838 | 12.132 | 16.265 | 23.254 |
| 4.644999999999839 | 12.155 | 16.29 | 23.282 |
| 4.649999999999838 | 12.179 | 16.316 | 23.31 |
| 4.654999999999839 | 12.203 | 16.341 | 23.337 |
| 4.659999999999838 | 12.227 | 16.366 | 23.365 |
| 4.664999999999838 | 12.251 | 16.392 | 23.393 |
| 4.669999999999838 | 12.274 | 16.417 | 23.42 |
| 4.674999999999838 | 12.298 | 16.442 | 23.448 |
| 4.679999999999837 | 12.322 | 16.468 | 23.476 |
| 4.684999999999838 | 12.346 | 16.493 | 23.504 |
| 4.689999999999837 | 12.37 | 16.519 | 23.532 |
| 4.694999999999838 | 12.394 | 16.544 | 23.559 |
| 4.699999999999837 | 12.418 | 16.57 | 23.587 |
| 4.704999999999837 | 12.442 | 16.595 | 23.615 |
| 4.709999999999837 | 12.466 | 16.621 | 23.643 |
| 4.714999999999837 | 12.49 | 16.647 | 23.671 |
| 4.719999999999837 | 12.514 | 16.672 | 23.699 |
| 4.724999999999837 | 12.539 | 16.698 | 23.727 |
| 4.729999999999836 | 12.563 | 16.723 | 23.755 |
| 4.734999999999836 | 12.587 | 16.749 | 23.783 |
| 4.739999999999836 | 12.611 | 16.775 | 23.811 |
| 4.744999999999836 | 12.635 | 16.801 | 23.839 |
| 4.749999999999836 | 12.66 | 16.826 | 23.867 |
| 4.754999999999836 | 12.684 | 16.852 | 23.895 |
| 4.759999999999836 | 12.708 | 16.878 | 23.923 |
| 4.764999999999836 | 12.733 | 16.904 | 23.952 |
| 4.769999999999836 | 12.757 | 16.93 | 23.98 |
| 4.774999999999835 | 12.781 | 16.955 | 24.008 |
| 4.779999999999835 | 12.806 | 16.981 | 24.036 |
| 4.784999999999835 | 12.83 | 17.007 | 24.064 |
| 4.789999999999835 | 12.855 | 17.033 | 24.093 |
| 4.794999999999835 | 12.879 | 17.059 | 24.121 |
| 4.799999999999835 | 12.904 | 17.085 | 24.149 |
| 4.804999999999835 | 12.928 | 17.111 | 24.177 |
| 4.809999999999835 | 12.953 | 17.137 | 24.206 |
| 4.814999999999835 | 12.977 | 17.163 | 24.234 |
| 4.819999999999835 | 13.002 | 17.189 | 24.262 |
| 4.824999999999835 | 13.026 | 17.215 | 24.291 |
| 4.829999999999834 | 13.051 | 17.242 | 24.319 |
| 4.834999999999834 | 13.076 | 17.268 | 24.348 |
| 4.839999999999834 | 13.1 | 17.294 | 24.376 |
| 4.844999999999834 | 13.125 | 17.32 | 24.405 |
| 4.849999999999834 | 13.15 | 17.346 | 24.433 |
| 4.854999999999834 | 13.175 | 17.373 | 24.462 |
| 4.859999999999834 | 13.2 | 17.399 | 24.49 |
| 4.864999999999834 | 13.224 | 17.425 | 24.519 |
| 4.869999999999834 | 13.249 | 17.451 | 24.547 |
| 4.874999999999834 | 13.274 | 17.478 | 24.576 |
| 4.879999999999833 | 13.299 | 17.504 | 24.605 |
| 4.884999999999834 | 13.324 | 17.531 | 24.633 |
| 4.889999999999833 | 13.349 | 17.557 | 24.662 |
| 4.894999999999833 | 13.374 | 17.583 | 24.691 |
| 4.899999999999833 | 13.399 | 17.61 | 24.719 |
| 4.904999999999833 | 13.424 | 17.636 | 24.748 |
| 4.909999999999833 | 13.449 | 17.663 | 24.777 |
| 4.914999999999833 | 13.474 | 17.689 | 24.806 |
| 4.919999999999832 | 13.499 | 17.716 | 24.834 |
| 4.924999999999833 | 13.524 | 17.742 | 24.863 |
| 4.929999999999832 | 13.549 | 17.769 | 24.892 |
| 4.934999999999832 | 13.574 | 17.796 | 24.921 |
| 4.939999999999832 | 13.6 | 17.822 | 24.95 |
| 4.944999999999832 | 13.625 | 17.849 | 24.979 |
| 4.949999999999832 | 13.65 | 17.876 | 25.008 |
| 4.954999999999832 | 13.675 | 17.902 | 25.037 |
| 4.959999999999832 | 13.701 | 17.929 | 25.066 |
| 4.964999999999832 | 13.726 | 17.956 | 25.095 |
| 4.969999999999831 | 13.751 | 17.983 | 25.124 |
| 4.974999999999831 | 13.777 | 18.009 | 25.153 |
| 4.97999999999983 | 13.802 | 18.036 | 25.182 |
| 4.984999999999831 | 13.827 | 18.063 | 25.211 |
| 4.98999999999983 | 13.853 | 18.09 | 25.24 |
| 4.994999999999831 | 13.878 | 18.117 | 25.269 |
| 4.99999999999983 | 13.904 | 18.144 | 25.298 |